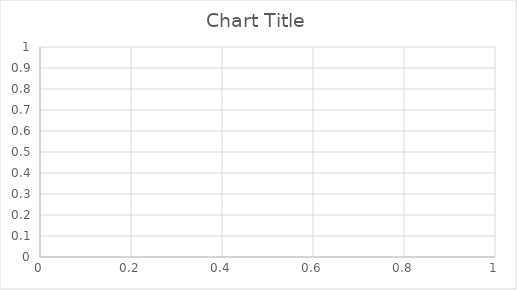
| Category | Series 0 |
|---|---|
| 0 | 0.027 |
| 1 | 0.071 |
| 2 | 0.192 |
| 3 | 0.175 |
| 4 | 0.144 |
| 5 | 0.23 |
| 6 | 0.202 |
| 7 | 0.246 |
| 8 | 0.242 |
| 9 | 0.257 |
| 10 | 0.289 |
| 11 | 0.348 |
| 12 | 0.375 |
| 13 | 0.348 |
| 14 | 0.333 |
| 15 | 0.33 |
| 16 | 0.326 |
| 17 | 0.332 |
| 18 | 0.34 |
| 19 | 0.325 |
| 20 | 0.349 |
| 21 | 0.345 |
| 22 | 0.362 |
| 23 | 0.364 |
| 24 | 0.353 |
| 25 | 0.363 |
| 26 | 0.355 |
| 27 | 0.359 |
| 28 | 0.371 |
| 29 | 0.37 |
| 30 | 0.363 |
| 31 | 0.377 |
| 32 | 0.394 |
| 33 | 0.395 |
| 34 | 0.402 |
| 35 | 0.394 |
| 36 | 0.389 |
| 37 | 0.388 |
| 38 | 0.381 |
| 39 | 0.372 |
| 40 | 0.383 |
| 41 | 0.389 |
| 42 | 0.381 |
| 43 | 0.382 |
| 44 | 0.39 |
| 45 | 0.384 |
| 46 | 0.377 |
| 47 | 0.373 |
| 48 | 0.382 |
| 49 | 0.383 |
| 50 | 0.376 |
| 51 | 0.374 |
| 52 | 0.385 |
| 53 | 0.379 |
| 54 | 0.377 |
| 55 | 0.372 |
| 56 | 0.366 |
| 57 | 0.374 |
| 58 | 0.374 |
| 59 | 0.368 |
| 60 | 0.369 |
| 61 | 0.374 |
| 62 | 0.383 |
| 63 | 0.378 |
| 64 | 0.374 |
| 65 | 0.37 |
| 66 | 0.376 |
| 67 | 0.377 |
| 68 | 0.38 |
| 69 | 0.376 |
| 70 | 0.376 |
| 71 | 0.372 |
| 72 | 0.367 |
| 73 | 0.363 |
| 74 | 0.36 |
| 75 | 0.358 |
| 76 | 0.359 |
| 77 | 0.358 |
| 78 | 0.356 |
| 79 | 0.357 |
| 80 | 0.353 |
| 81 | 0.35 |
| 82 | 0.346 |
| 83 | 0.346 |
| 84 | 0.351 |
| 85 | 0.35 |
| 86 | 0.349 |
| 87 | 0.355 |
| 88 | 0.357 |
| 89 | 0.353 |
| 90 | 0.349 |
| 91 | 0.349 |
| 92 | 0.35 |
| 93 | 0.348 |
| 94 | 0.345 |
| 95 | 0.343 |
| 96 | 0.346 |
| 97 | 0.345 |
| 98 | 0.343 |
| 99 | 0.347 |
| 100 | 0.344 |
| 101 | 0.351 |
| 102 | 0.357 |
| 103 | 0.359 |
| 104 | 0.355 |
| 105 | 0.359 |
| 106 | 0.36 |
| 107 | 0.363 |
| 108 | 0.362 |
| 109 | 0.359 |
| 110 | 0.358 |
| 111 | 0.355 |
| 112 | 0.356 |
| 113 | 0.361 |
| 114 | 0.359 |
| 115 | 0.357 |
| 116 | 0.354 |
| 117 | 0.351 |
| 118 | 0.349 |
| 119 | 0.347 |
| 120 | 0.345 |
| 121 | 0.346 |
| 122 | 0.344 |
| 123 | 0.341 |
| 124 | 0.342 |
| 125 | 0.339 |
| 126 | 0.338 |
| 127 | 0.339 |
| 128 | 0.337 |
| 129 | 0.338 |
| 130 | 0.336 |
| 131 | 0.34 |
| 132 | 0.339 |
| 133 | 0.338 |
| 134 | 0.337 |
| 135 | 0.34 |
| 136 | 0.339 |
| 137 | 0.341 |
| 138 | 0.339 |
| 139 | 0.339 |
| 140 | 0.338 |
| 141 | 0.34 |
| 142 | 0.344 |
| 143 | 0.344 |
| 144 | 0.343 |
| 145 | 0.347 |
| 146 | 0.345 |
| 147 | 0.344 |
| 148 | 0.342 |
| 149 | 0.34 |
| 150 | 0.34 |
| 151 | 0.338 |
| 152 | 0.336 |
| 153 | 0.338 |
| 154 | 0.339 |
| 155 | 0.337 |
| 156 | 0.338 |
| 157 | 0.337 |
| 158 | 0.339 |
| 159 | 0.337 |
| 160 | 0.337 |
| 161 | 0.341 |
| 162 | 0.34 |
| 163 | 0.34 |
| 164 | 0.338 |
| 165 | 0.336 |
| 166 | 0.339 |
| 167 | 0.337 |
| 168 | 0.341 |
| 169 | 0.341 |
| 170 | 0.339 |
| 171 | 0.342 |
| 172 | 0.343 |
| 173 | 0.341 |
| 174 | 0.342 |
| 175 | 0.343 |
| 176 | 0.346 |
| 177 | 0.344 |
| 178 | 0.345 |
| 179 | 0.344 |
| 180 | 0.345 |
| 181 | 0.344 |
| 182 | 0.343 |
| 183 | 0.344 |
| 184 | 0.346 |
| 185 | 0.347 |
| 186 | 0.346 |
| 187 | 0.349 |
| 188 | 0.349 |
| 189 | 0.351 |
| 190 | 0.349 |
| 191 | 0.352 |
| 192 | 0.352 |
| 193 | 0.353 |
| 194 | 0.353 |
| 195 | 0.353 |
| 196 | 0.353 |
| 197 | 0.351 |
| 198 | 0.351 |
| 199 | 0.349 |
| 200 | 0.35 |
| 201 | 0.349 |
| 202 | 0.35 |
| 203 | 0.352 |
| 204 | 0.353 |
| 205 | 0.353 |
| 206 | 0.352 |
| 207 | 0.35 |
| 208 | 0.349 |
| 209 | 0.35 |
| 210 | 0.35 |
| 211 | 0.349 |
| 212 | 0.35 |
| 213 | 0.349 |
| 214 | 0.347 |
| 215 | 0.346 |
| 216 | 0.348 |
| 217 | 0.35 |
| 218 | 0.35 |
| 219 | 0.348 |
| 220 | 0.347 |
| 221 | 0.346 |
| 222 | 0.344 |
| 223 | 0.346 |
| 224 | 0.344 |
| 225 | 0.343 |
| 226 | 0.343 |
| 227 | 0.341 |
| 228 | 0.341 |
| 229 | 0.341 |
| 230 | 0.34 |
| 231 | 0.339 |
| 232 | 0.341 |
| 233 | 0.339 |
| 234 | 0.339 |
| 235 | 0.338 |
| 236 | 0.338 |
| 237 | 0.337 |
| 238 | 0.336 |
| 239 | 0.337 |
| 240 | 0.336 |
| 241 | 0.335 |
| 242 | 0.334 |
| 243 | 0.334 |
| 244 | 0.335 |
| 245 | 0.335 |
| 246 | 0.334 |
| 247 | 0.332 |
| 248 | 0.331 |
| 249 | 0.333 |
| 250 | 0.332 |
| 251 | 0.334 |
| 252 | 0.335 |
| 253 | 0.336 |
| 254 | 0.335 |
| 255 | 0.334 |
| 256 | 0.333 |
| 257 | 0.335 |
| 258 | 0.336 |
| 259 | 0.335 |
| 260 | 0.334 |
| 261 | 0.334 |
| 262 | 0.334 |
| 263 | 0.333 |
| 264 | 0.335 |
| 265 | 0.336 |
| 266 | 0.335 |
| 267 | 0.336 |
| 268 | 0.337 |
| 269 | 0.337 |
| 270 | 0.337 |
| 271 | 0.338 |
| 272 | 0.337 |
| 273 | 0.336 |
| 274 | 0.335 |
| 275 | 0.334 |
| 276 | 0.335 |
| 277 | 0.335 |
| 278 | 0.336 |
| 279 | 0.335 |
| 280 | 0.337 |
| 281 | 0.339 |
| 282 | 0.338 |
| 283 | 0.337 |
| 284 | 0.336 |
| 285 | 0.335 |
| 286 | 0.334 |
| 287 | 0.333 |
| 288 | 0.332 |
| 289 | 0.332 |
| 290 | 0.332 |
| 291 | 0.333 |
| 292 | 0.333 |
| 293 | 0.332 |
| 294 | 0.334 |
| 295 | 0.335 |
| 296 | 0.334 |
| 297 | 0.334 |
| 298 | 0.335 |
| 299 | 0.336 |
| 300 | 0.336 |
| 301 | 0.336 |
| 302 | 0.335 |
| 303 | 0.334 |
| 304 | 0.334 |
| 305 | 0.333 |
| 306 | 0.332 |
| 307 | 0.333 |
| 308 | 0.332 |
| 309 | 0.332 |
| 310 | 0.332 |
| 311 | 0.332 |
| 312 | 0.331 |
| 313 | 0.33 |
| 314 | 0.33 |
| 315 | 0.33 |
| 316 | 0.331 |
| 317 | 0.331 |
| 318 | 0.33 |
| 319 | 0.329 |
| 320 | 0.329 |
| 321 | 0.33 |
| 322 | 0.329 |
| 323 | 0.328 |
| 324 | 0.328 |
| 325 | 0.329 |
| 326 | 0.329 |
| 327 | 0.329 |
| 328 | 0.328 |
| 329 | 0.33 |
| 330 | 0.329 |
| 331 | 0.328 |
| 332 | 0.327 |
| 333 | 0.327 |
| 334 | 0.328 |
| 335 | 0.327 |
| 336 | 0.328 |
| 337 | 0.33 |
| 338 | 0.332 |
| 339 | 0.332 |
| 340 | 0.334 |
| 341 | 0.335 |
| 342 | 0.336 |
| 343 | 0.336 |
| 344 | 0.336 |
| 345 | 0.337 |
| 346 | 0.338 |
| 347 | 0.337 |
| 348 | 0.336 |
| 349 | 0.338 |
| 350 | 0.337 |
| 351 | 0.337 |
| 352 | 0.336 |
| 353 | 0.337 |
| 354 | 0.336 |
| 355 | 0.337 |
| 356 | 0.338 |
| 357 | 0.337 |
| 358 | 0.339 |
| 359 | 0.339 |
| 360 | 0.339 |
| 361 | 0.339 |
| 362 | 0.338 |
| 363 | 0.337 |
| 364 | 0.338 |
| 365 | 0.338 |
| 366 | 0.339 |
| 367 | 0.339 |
| 368 | 0.34 |
| 369 | 0.341 |
| 370 | 0.34 |
| 371 | 0.34 |
| 372 | 0.34 |
| 373 | 0.339 |
| 374 | 0.34 |
| 375 | 0.34 |
| 376 | 0.339 |
| 377 | 0.338 |
| 378 | 0.337 |
| 379 | 0.337 |
| 380 | 0.338 |
| 381 | 0.338 |
| 382 | 0.339 |
| 383 | 0.338 |
| 384 | 0.337 |
| 385 | 0.337 |
| 386 | 0.338 |
| 387 | 0.337 |
| 388 | 0.338 |
| 389 | 0.337 |
| 390 | 0.336 |
| 391 | 0.336 |
| 392 | 0.336 |
| 393 | 0.336 |
| 394 | 0.337 |
| 395 | 0.339 |
| 396 | 0.34 |
| 397 | 0.339 |
| 398 | 0.338 |
| 399 | 0.339 |
| 400 | 0.338 |
| 401 | 0.337 |
| 402 | 0.337 |
| 403 | 0.336 |
| 404 | 0.336 |
| 405 | 0.337 |
| 406 | 0.337 |
| 407 | 0.339 |
| 408 | 0.339 |
| 409 | 0.34 |
| 410 | 0.339 |
| 411 | 0.338 |
| 412 | 0.338 |
| 413 | 0.339 |
| 414 | 0.338 |
| 415 | 0.338 |
| 416 | 0.338 |
| 417 | 0.337 |
| 418 | 0.337 |
| 419 | 0.338 |
| 420 | 0.339 |
| 421 | 0.339 |
| 422 | 0.34 |
| 423 | 0.34 |
| 424 | 0.341 |
| 425 | 0.341 |
| 426 | 0.34 |
| 427 | 0.34 |
| 428 | 0.34 |
| 429 | 0.339 |
| 430 | 0.339 |
| 431 | 0.338 |
| 432 | 0.339 |
| 433 | 0.339 |
| 434 | 0.34 |
| 435 | 0.341 |
| 436 | 0.341 |
| 437 | 0.34 |
| 438 | 0.34 |
| 439 | 0.339 |
| 440 | 0.338 |
| 441 | 0.338 |
| 442 | 0.337 |
| 443 | 0.337 |
| 444 | 0.338 |
| 445 | 0.339 |
| 446 | 0.338 |
| 447 | 0.338 |
| 448 | 0.338 |
| 449 | 0.338 |
| 450 | 0.338 |
| 451 | 0.338 |
| 452 | 0.337 |
| 453 | 0.337 |
| 454 | 0.336 |
| 455 | 0.336 |
| 456 | 0.335 |
| 457 | 0.335 |
| 458 | 0.336 |
| 459 | 0.337 |
| 460 | 0.336 |
| 461 | 0.336 |
| 462 | 0.337 |
| 463 | 0.338 |
| 464 | 0.337 |
| 465 | 0.338 |
| 466 | 0.339 |
| 467 | 0.34 |
| 468 | 0.34 |
| 469 | 0.341 |
| 470 | 0.343 |
| 471 | 0.342 |
| 472 | 0.342 |
| 473 | 0.343 |
| 474 | 0.342 |
| 475 | 0.343 |
| 476 | 0.342 |
| 477 | 0.342 |
| 478 | 0.341 |
| 479 | 0.341 |
| 480 | 0.34 |
| 481 | 0.34 |
| 482 | 0.339 |
| 483 | 0.338 |
| 484 | 0.338 |
| 485 | 0.338 |
| 486 | 0.338 |
| 487 | 0.338 |
| 488 | 0.339 |
| 489 | 0.34 |
| 490 | 0.339 |
| 491 | 0.339 |
| 492 | 0.339 |
| 493 | 0.338 |
| 494 | 0.338 |
| 495 | 0.339 |
| 496 | 0.339 |
| 497 | 0.338 |
| 498 | 0.338 |
| 499 | 0.337 |
| 500 | 0.337 |
| 501 | 0.336 |
| 502 | 0.336 |
| 503 | 0.336 |
| 504 | 0.335 |
| 505 | 0.335 |
| 506 | 0.335 |
| 507 | 0.335 |
| 508 | 0.336 |
| 509 | 0.336 |
| 510 | 0.336 |
| 511 | 0.337 |
| 512 | 0.337 |
| 513 | 0.338 |
| 514 | 0.339 |
| 515 | 0.34 |
| 516 | 0.339 |
| 517 | 0.34 |
| 518 | 0.341 |
| 519 | 0.34 |
| 520 | 0.34 |
| 521 | 0.34 |
| 522 | 0.339 |
| 523 | 0.339 |
| 524 | 0.34 |
| 525 | 0.339 |
| 526 | 0.339 |
| 527 | 0.338 |
| 528 | 0.339 |
| 529 | 0.338 |
| 530 | 0.338 |
| 531 | 0.338 |
| 532 | 0.337 |
| 533 | 0.337 |
| 534 | 0.336 |
| 535 | 0.337 |
| 536 | 0.338 |
| 537 | 0.338 |
| 538 | 0.337 |
| 539 | 0.336 |
| 540 | 0.336 |
| 541 | 0.335 |
| 542 | 0.335 |
| 543 | 0.335 |
| 544 | 0.335 |
| 545 | 0.335 |
| 546 | 0.336 |
| 547 | 0.336 |
| 548 | 0.335 |
| 549 | 0.335 |
| 550 | 0.335 |
| 551 | 0.335 |
| 552 | 0.335 |
| 553 | 0.334 |
| 554 | 0.334 |
| 555 | 0.334 |
| 556 | 0.333 |
| 557 | 0.334 |
| 558 | 0.334 |
| 559 | 0.333 |
| 560 | 0.333 |
| 561 | 0.333 |
| 562 | 0.332 |
| 563 | 0.332 |
| 564 | 0.331 |
| 565 | 0.331 |
| 566 | 0.331 |
| 567 | 0.332 |
| 568 | 0.331 |
| 569 | 0.331 |
| 570 | 0.331 |
| 571 | 0.331 |
| 572 | 0.331 |
| 573 | 0.331 |
| 574 | 0.331 |
| 575 | 0.331 |
| 576 | 0.331 |
| 577 | 0.331 |
| 578 | 0.331 |
| 579 | 0.33 |
| 580 | 0.33 |
| 581 | 0.331 |
| 582 | 0.331 |
| 583 | 0.331 |
| 584 | 0.332 |
| 585 | 0.331 |
| 586 | 0.331 |
| 587 | 0.331 |
| 588 | 0.332 |
| 589 | 0.331 |
| 590 | 0.332 |
| 591 | 0.332 |
| 592 | 0.331 |
| 593 | 0.331 |
| 594 | 0.331 |
| 595 | 0.331 |
| 596 | 0.33 |
| 597 | 0.33 |
| 598 | 0.33 |
| 599 | 0.331 |
| 600 | 0.332 |
| 601 | 0.331 |
| 602 | 0.331 |
| 603 | 0.332 |
| 604 | 0.332 |
| 605 | 0.331 |
| 606 | 0.331 |
| 607 | 0.331 |
| 608 | 0.331 |
| 609 | 0.332 |
| 610 | 0.332 |
| 611 | 0.331 |
| 612 | 0.331 |
| 613 | 0.331 |
| 614 | 0.332 |
| 615 | 0.332 |
| 616 | 0.333 |
| 617 | 0.334 |
| 618 | 0.334 |
| 619 | 0.334 |
| 620 | 0.333 |
| 621 | 0.334 |
| 622 | 0.334 |
| 623 | 0.334 |
| 624 | 0.333 |
| 625 | 0.334 |
| 626 | 0.334 |
| 627 | 0.334 |
| 628 | 0.335 |
| 629 | 0.335 |
| 630 | 0.334 |
| 631 | 0.334 |
| 632 | 0.334 |
| 633 | 0.335 |
| 634 | 0.336 |
| 635 | 0.335 |
| 636 | 0.335 |
| 637 | 0.334 |
| 638 | 0.335 |
| 639 | 0.335 |
| 640 | 0.335 |
| 641 | 0.334 |
| 642 | 0.334 |
| 643 | 0.334 |
| 644 | 0.333 |
| 645 | 0.333 |
| 646 | 0.333 |
| 647 | 0.333 |
| 648 | 0.333 |
| 649 | 0.333 |
| 650 | 0.333 |
| 651 | 0.333 |
| 652 | 0.332 |
| 653 | 0.332 |
| 654 | 0.332 |
| 655 | 0.333 |
| 656 | 0.332 |
| 657 | 0.332 |
| 658 | 0.332 |
| 659 | 0.331 |
| 660 | 0.331 |
| 661 | 0.331 |
| 662 | 0.331 |
| 663 | 0.331 |
| 664 | 0.331 |
| 665 | 0.331 |
| 666 | 0.331 |
| 667 | 0.331 |
| 668 | 0.331 |
| 669 | 0.332 |
| 670 | 0.332 |
| 671 | 0.331 |
| 672 | 0.332 |
| 673 | 0.333 |
| 674 | 0.333 |
| 675 | 0.333 |
| 676 | 0.333 |
| 677 | 0.333 |
| 678 | 0.333 |
| 679 | 0.333 |
| 680 | 0.333 |
| 681 | 0.333 |
| 682 | 0.332 |
| 683 | 0.332 |
| 684 | 0.332 |
| 685 | 0.332 |
| 686 | 0.331 |
| 687 | 0.331 |
| 688 | 0.331 |
| 689 | 0.331 |
| 690 | 0.332 |
| 691 | 0.332 |
| 692 | 0.331 |
| 693 | 0.332 |
| 694 | 0.331 |
| 695 | 0.331 |
| 696 | 0.331 |
| 697 | 0.331 |
| 698 | 0.33 |
| 699 | 0.33 |
| 700 | 0.33 |
| 701 | 0.331 |
| 702 | 0.331 |
| 703 | 0.331 |
| 704 | 0.331 |
| 705 | 0.331 |
| 706 | 0.331 |
| 707 | 0.331 |
| 708 | 0.331 |
| 709 | 0.33 |
| 710 | 0.331 |
| 711 | 0.331 |
| 712 | 0.332 |
| 713 | 0.331 |
| 714 | 0.331 |
| 715 | 0.331 |
| 716 | 0.332 |
| 717 | 0.332 |
| 718 | 0.332 |
| 719 | 0.332 |
| 720 | 0.331 |
| 721 | 0.332 |
| 722 | 0.333 |
| 723 | 0.334 |
| 724 | 0.334 |
| 725 | 0.333 |
| 726 | 0.334 |
| 727 | 0.334 |
| 728 | 0.334 |
| 729 | 0.334 |
| 730 | 0.335 |
| 731 | 0.335 |
| 732 | 0.335 |
| 733 | 0.335 |
| 734 | 0.335 |
| 735 | 0.335 |
| 736 | 0.336 |
| 737 | 0.335 |
| 738 | 0.336 |
| 739 | 0.336 |
| 740 | 0.337 |
| 741 | 0.336 |
| 742 | 0.336 |
| 743 | 0.336 |
| 744 | 0.336 |
| 745 | 0.336 |
| 746 | 0.336 |
| 747 | 0.336 |
| 748 | 0.336 |
| 749 | 0.337 |
| 750 | 0.337 |
| 751 | 0.337 |
| 752 | 0.337 |
| 753 | 0.338 |
| 754 | 0.338 |
| 755 | 0.338 |
| 756 | 0.339 |
| 757 | 0.339 |
| 758 | 0.338 |
| 759 | 0.339 |
| 760 | 0.338 |
| 761 | 0.338 |
| 762 | 0.338 |
| 763 | 0.338 |
| 764 | 0.337 |
| 765 | 0.337 |
| 766 | 0.338 |
| 767 | 0.338 |
| 768 | 0.338 |
| 769 | 0.339 |
| 770 | 0.339 |
| 771 | 0.339 |
| 772 | 0.339 |
| 773 | 0.339 |
| 774 | 0.339 |
| 775 | 0.339 |
| 776 | 0.339 |
| 777 | 0.339 |
| 778 | 0.338 |
| 779 | 0.338 |
| 780 | 0.338 |
| 781 | 0.338 |
| 782 | 0.338 |
| 783 | 0.338 |
| 784 | 0.338 |
| 785 | 0.338 |
| 786 | 0.338 |
| 787 | 0.338 |
| 788 | 0.338 |
| 789 | 0.337 |
| 790 | 0.338 |
| 791 | 0.338 |
| 792 | 0.337 |
| 793 | 0.337 |
| 794 | 0.337 |
| 795 | 0.337 |
| 796 | 0.336 |
| 797 | 0.336 |
| 798 | 0.336 |
| 799 | 0.335 |
| 800 | 0.335 |
| 801 | 0.335 |
| 802 | 0.336 |
| 803 | 0.336 |
| 804 | 0.336 |
| 805 | 0.336 |
| 806 | 0.336 |
| 807 | 0.337 |
| 808 | 0.336 |
| 809 | 0.336 |
| 810 | 0.336 |
| 811 | 0.336 |
| 812 | 0.335 |
| 813 | 0.335 |
| 814 | 0.335 |
| 815 | 0.335 |
| 816 | 0.334 |
| 817 | 0.334 |
| 818 | 0.334 |
| 819 | 0.333 |
| 820 | 0.334 |
| 821 | 0.334 |
| 822 | 0.334 |
| 823 | 0.334 |
| 824 | 0.334 |
| 825 | 0.333 |
| 826 | 0.334 |
| 827 | 0.334 |
| 828 | 0.335 |
| 829 | 0.334 |
| 830 | 0.335 |
| 831 | 0.336 |
| 832 | 0.336 |
| 833 | 0.335 |
| 834 | 0.335 |
| 835 | 0.335 |
| 836 | 0.335 |
| 837 | 0.335 |
| 838 | 0.335 |
| 839 | 0.335 |
| 840 | 0.334 |
| 841 | 0.334 |
| 842 | 0.335 |
| 843 | 0.335 |
| 844 | 0.335 |
| 845 | 0.334 |
| 846 | 0.334 |
| 847 | 0.334 |
| 848 | 0.334 |
| 849 | 0.335 |
| 850 | 0.335 |
| 851 | 0.335 |
| 852 | 0.335 |
| 853 | 0.335 |
| 854 | 0.335 |
| 855 | 0.336 |
| 856 | 0.336 |
| 857 | 0.335 |
| 858 | 0.335 |
| 859 | 0.335 |
| 860 | 0.334 |
| 861 | 0.334 |
| 862 | 0.334 |
| 863 | 0.334 |
| 864 | 0.333 |
| 865 | 0.333 |
| 866 | 0.333 |
| 867 | 0.333 |
| 868 | 0.333 |
| 869 | 0.332 |
| 870 | 0.332 |
| 871 | 0.332 |
| 872 | 0.332 |
| 873 | 0.332 |
| 874 | 0.332 |
| 875 | 0.332 |
| 876 | 0.332 |
| 877 | 0.331 |
| 878 | 0.331 |
| 879 | 0.331 |
| 880 | 0.332 |
| 881 | 0.331 |
| 882 | 0.331 |
| 883 | 0.331 |
| 884 | 0.33 |
| 885 | 0.33 |
| 886 | 0.33 |
| 887 | 0.33 |
| 888 | 0.33 |
| 889 | 0.331 |
| 890 | 0.331 |
| 891 | 0.331 |
| 892 | 0.33 |
| 893 | 0.33 |
| 894 | 0.33 |
| 895 | 0.33 |
| 896 | 0.33 |
| 897 | 0.33 |
| 898 | 0.33 |
| 899 | 0.331 |
| 900 | 0.331 |
| 901 | 0.33 |
| 902 | 0.331 |
| 903 | 0.331 |
| 904 | 0.331 |
| 905 | 0.331 |
| 906 | 0.331 |
| 907 | 0.331 |
| 908 | 0.331 |
| 909 | 0.331 |
| 910 | 0.331 |
| 911 | 0.332 |
| 912 | 0.332 |
| 913 | 0.332 |
| 914 | 0.332 |
| 915 | 0.332 |
| 916 | 0.332 |
| 917 | 0.332 |
| 918 | 0.331 |
| 919 | 0.331 |
| 920 | 0.331 |
| 921 | 0.331 |
| 922 | 0.33 |
| 923 | 0.331 |
| 924 | 0.331 |
| 925 | 0.331 |
| 926 | 0.332 |
| 927 | 0.331 |
| 928 | 0.331 |
| 929 | 0.331 |
| 930 | 0.33 |
| 931 | 0.33 |
| 932 | 0.33 |
| 933 | 0.329 |
| 934 | 0.329 |
| 935 | 0.329 |
| 936 | 0.328 |
| 937 | 0.328 |
| 938 | 0.329 |
| 939 | 0.328 |
| 940 | 0.328 |
| 941 | 0.328 |
| 942 | 0.328 |
| 943 | 0.327 |
| 944 | 0.327 |
| 945 | 0.327 |
| 946 | 0.327 |
| 947 | 0.327 |
| 948 | 0.328 |
| 949 | 0.327 |
| 950 | 0.327 |
| 951 | 0.327 |
| 952 | 0.327 |
| 953 | 0.327 |
| 954 | 0.327 |
| 955 | 0.328 |
| 956 | 0.327 |
| 957 | 0.327 |
| 958 | 0.327 |
| 959 | 0.327 |
| 960 | 0.327 |
| 961 | 0.327 |
| 962 | 0.327 |
| 963 | 0.327 |
| 964 | 0.327 |
| 965 | 0.327 |
| 966 | 0.327 |
| 967 | 0.327 |
| 968 | 0.327 |
| 969 | 0.326 |
| 970 | 0.327 |
| 971 | 0.326 |
| 972 | 0.326 |
| 973 | 0.326 |
| 974 | 0.326 |
| 975 | 0.326 |
| 976 | 0.326 |
| 977 | 0.326 |
| 978 | 0.326 |
| 979 | 0.326 |
| 980 | 0.326 |
| 981 | 0.326 |
| 982 | 0.326 |
| 983 | 0.326 |
| 984 | 0.326 |
| 985 | 0.326 |
| 986 | 0.326 |
| 987 | 0.326 |
| 988 | 0.327 |
| 989 | 0.327 |
| 990 | 0.327 |
| 991 | 0.327 |
| 992 | 0.327 |
| 993 | 0.326 |
| 994 | 0.326 |
| 995 | 0.327 |
| 996 | 0.327 |
| 997 | 0.326 |
| 998 | 0.326 |
| 999 | 0.326 |
| 1000 | 0.326 |
| 1001 | 0.326 |
| 1002 | 0.326 |
| 1003 | 0.326 |
| 1004 | 0.326 |
| 1005 | 0.327 |
| 1006 | 0.327 |
| 1007 | 0.326 |
| 1008 | 0.326 |
| 1009 | 0.326 |
| 1010 | 0.326 |
| 1011 | 0.326 |
| 1012 | 0.326 |
| 1013 | 0.326 |
| 1014 | 0.326 |
| 1015 | 0.325 |
| 1016 | 0.326 |
| 1017 | 0.326 |
| 1018 | 0.326 |
| 1019 | 0.326 |
| 1020 | 0.326 |
| 1021 | 0.326 |
| 1022 | 0.327 |
| 1023 | 0.327 |
| 1024 | 0.327 |
| 1025 | 0.327 |
| 1026 | 0.327 |
| 1027 | 0.327 |
| 1028 | 0.327 |
| 1029 | 0.327 |
| 1030 | 0.327 |
| 1031 | 0.327 |
| 1032 | 0.327 |
| 1033 | 0.326 |
| 1034 | 0.327 |
| 1035 | 0.327 |
| 1036 | 0.327 |
| 1037 | 0.327 |
| 1038 | 0.327 |
| 1039 | 0.326 |
| 1040 | 0.326 |
| 1041 | 0.326 |
| 1042 | 0.326 |
| 1043 | 0.326 |
| 1044 | 0.326 |
| 1045 | 0.326 |
| 1046 | 0.325 |
| 1047 | 0.325 |
| 1048 | 0.326 |
| 1049 | 0.325 |
| 1050 | 0.325 |
| 1051 | 0.325 |
| 1052 | 0.325 |
| 1053 | 0.325 |
| 1054 | 0.325 |
| 1055 | 0.325 |
| 1056 | 0.325 |
| 1057 | 0.325 |
| 1058 | 0.326 |
| 1059 | 0.326 |
| 1060 | 0.327 |
| 1061 | 0.326 |
| 1062 | 0.326 |
| 1063 | 0.327 |
| 1064 | 0.327 |
| 1065 | 0.327 |
| 1066 | 0.327 |
| 1067 | 0.327 |
| 1068 | 0.328 |
| 1069 | 0.328 |
| 1070 | 0.327 |
| 1071 | 0.328 |
| 1072 | 0.328 |
| 1073 | 0.328 |
| 1074 | 0.328 |
| 1075 | 0.329 |
| 1076 | 0.329 |
| 1077 | 0.329 |
| 1078 | 0.328 |
| 1079 | 0.328 |
| 1080 | 0.328 |
| 1081 | 0.328 |
| 1082 | 0.328 |
| 1083 | 0.328 |
| 1084 | 0.328 |
| 1085 | 0.329 |
| 1086 | 0.329 |
| 1087 | 0.328 |
| 1088 | 0.328 |
| 1089 | 0.328 |
| 1090 | 0.328 |
| 1091 | 0.328 |
| 1092 | 0.328 |
| 1093 | 0.328 |
| 1094 | 0.328 |
| 1095 | 0.328 |
| 1096 | 0.328 |
| 1097 | 0.328 |
| 1098 | 0.328 |
| 1099 | 0.328 |
| 1100 | 0.328 |
| 1101 | 0.328 |
| 1102 | 0.328 |
| 1103 | 0.328 |
| 1104 | 0.328 |
| 1105 | 0.328 |
| 1106 | 0.328 |
| 1107 | 0.328 |
| 1108 | 0.329 |
| 1109 | 0.328 |
| 1110 | 0.328 |
| 1111 | 0.328 |
| 1112 | 0.328 |
| 1113 | 0.328 |
| 1114 | 0.328 |
| 1115 | 0.328 |
| 1116 | 0.327 |
| 1117 | 0.328 |
| 1118 | 0.327 |
| 1119 | 0.327 |
| 1120 | 0.327 |
| 1121 | 0.327 |
| 1122 | 0.327 |
| 1123 | 0.327 |
| 1124 | 0.327 |
| 1125 | 0.327 |
| 1126 | 0.327 |
| 1127 | 0.327 |
| 1128 | 0.327 |
| 1129 | 0.326 |
| 1130 | 0.327 |
| 1131 | 0.326 |
| 1132 | 0.327 |
| 1133 | 0.326 |
| 1134 | 0.326 |
| 1135 | 0.327 |
| 1136 | 0.326 |
| 1137 | 0.326 |
| 1138 | 0.327 |
| 1139 | 0.326 |
| 1140 | 0.326 |
| 1141 | 0.326 |
| 1142 | 0.326 |
| 1143 | 0.326 |
| 1144 | 0.325 |
| 1145 | 0.325 |
| 1146 | 0.326 |
| 1147 | 0.326 |
| 1148 | 0.326 |
| 1149 | 0.326 |
| 1150 | 0.327 |
| 1151 | 0.327 |
| 1152 | 0.327 |
| 1153 | 0.327 |
| 1154 | 0.326 |
| 1155 | 0.326 |
| 1156 | 0.327 |
| 1157 | 0.327 |
| 1158 | 0.328 |
| 1159 | 0.328 |
| 1160 | 0.328 |
| 1161 | 0.328 |
| 1162 | 0.328 |
| 1163 | 0.328 |
| 1164 | 0.328 |
| 1165 | 0.328 |
| 1166 | 0.328 |
| 1167 | 0.328 |
| 1168 | 0.328 |
| 1169 | 0.328 |
| 1170 | 0.328 |
| 1171 | 0.327 |
| 1172 | 0.327 |
| 1173 | 0.327 |
| 1174 | 0.327 |
| 1175 | 0.327 |
| 1176 | 0.328 |
| 1177 | 0.328 |
| 1178 | 0.327 |
| 1179 | 0.328 |
| 1180 | 0.327 |
| 1181 | 0.327 |
| 1182 | 0.328 |
| 1183 | 0.328 |
| 1184 | 0.328 |
| 1185 | 0.328 |
| 1186 | 0.328 |
| 1187 | 0.328 |
| 1188 | 0.328 |
| 1189 | 0.328 |
| 1190 | 0.328 |
| 1191 | 0.328 |
| 1192 | 0.328 |
| 1193 | 0.328 |
| 1194 | 0.328 |
| 1195 | 0.329 |
| 1196 | 0.329 |
| 1197 | 0.329 |
| 1198 | 0.329 |
| 1199 | 0.33 |
| 1200 | 0.329 |
| 1201 | 0.329 |
| 1202 | 0.329 |
| 1203 | 0.329 |
| 1204 | 0.329 |
| 1205 | 0.329 |
| 1206 | 0.329 |
| 1207 | 0.329 |
| 1208 | 0.329 |
| 1209 | 0.329 |
| 1210 | 0.329 |
| 1211 | 0.329 |
| 1212 | 0.329 |
| 1213 | 0.329 |
| 1214 | 0.329 |
| 1215 | 0.328 |
| 1216 | 0.328 |
| 1217 | 0.328 |
| 1218 | 0.328 |
| 1219 | 0.329 |
| 1220 | 0.328 |
| 1221 | 0.328 |
| 1222 | 0.328 |
| 1223 | 0.328 |
| 1224 | 0.328 |
| 1225 | 0.328 |
| 1226 | 0.327 |
| 1227 | 0.328 |
| 1228 | 0.328 |
| 1229 | 0.327 |
| 1230 | 0.327 |
| 1231 | 0.327 |
| 1232 | 0.327 |
| 1233 | 0.327 |
| 1234 | 0.328 |
| 1235 | 0.327 |
| 1236 | 0.327 |
| 1237 | 0.328 |
| 1238 | 0.327 |
| 1239 | 0.328 |
| 1240 | 0.327 |
| 1241 | 0.327 |
| 1242 | 0.328 |
| 1243 | 0.328 |
| 1244 | 0.328 |
| 1245 | 0.328 |
| 1246 | 0.329 |
| 1247 | 0.328 |
| 1248 | 0.329 |
| 1249 | 0.329 |
| 1250 | 0.329 |
| 1251 | 0.329 |
| 1252 | 0.329 |
| 1253 | 0.329 |
| 1254 | 0.328 |
| 1255 | 0.329 |
| 1256 | 0.329 |
| 1257 | 0.329 |
| 1258 | 0.329 |
| 1259 | 0.329 |
| 1260 | 0.329 |
| 1261 | 0.328 |
| 1262 | 0.329 |
| 1263 | 0.329 |
| 1264 | 0.329 |
| 1265 | 0.328 |
| 1266 | 0.328 |
| 1267 | 0.329 |
| 1268 | 0.329 |
| 1269 | 0.329 |
| 1270 | 0.329 |
| 1271 | 0.33 |
| 1272 | 0.33 |
| 1273 | 0.33 |
| 1274 | 0.33 |
| 1275 | 0.33 |
| 1276 | 0.33 |
| 1277 | 0.33 |
| 1278 | 0.33 |
| 1279 | 0.33 |
| 1280 | 0.329 |
| 1281 | 0.329 |
| 1282 | 0.329 |
| 1283 | 0.329 |
| 1284 | 0.329 |
| 1285 | 0.329 |
| 1286 | 0.329 |
| 1287 | 0.329 |
| 1288 | 0.329 |
| 1289 | 0.329 |
| 1290 | 0.329 |
| 1291 | 0.329 |
| 1292 | 0.329 |
| 1293 | 0.329 |
| 1294 | 0.33 |
| 1295 | 0.33 |
| 1296 | 0.33 |
| 1297 | 0.33 |
| 1298 | 0.33 |
| 1299 | 0.33 |
| 1300 | 0.33 |
| 1301 | 0.33 |
| 1302 | 0.33 |
| 1303 | 0.33 |
| 1304 | 0.33 |
| 1305 | 0.33 |
| 1306 | 0.329 |
| 1307 | 0.33 |
| 1308 | 0.33 |
| 1309 | 0.33 |
| 1310 | 0.33 |
| 1311 | 0.33 |
| 1312 | 0.33 |
| 1313 | 0.33 |
| 1314 | 0.33 |
| 1315 | 0.33 |
| 1316 | 0.33 |
| 1317 | 0.329 |
| 1318 | 0.329 |
| 1319 | 0.329 |
| 1320 | 0.329 |
| 1321 | 0.329 |
| 1322 | 0.329 |
| 1323 | 0.329 |
| 1324 | 0.329 |
| 1325 | 0.329 |
| 1326 | 0.328 |
| 1327 | 0.328 |
| 1328 | 0.328 |
| 1329 | 0.328 |
| 1330 | 0.328 |
| 1331 | 0.328 |
| 1332 | 0.328 |
| 1333 | 0.329 |
| 1334 | 0.328 |
| 1335 | 0.329 |
| 1336 | 0.329 |
| 1337 | 0.329 |
| 1338 | 0.329 |
| 1339 | 0.328 |
| 1340 | 0.328 |
| 1341 | 0.328 |
| 1342 | 0.328 |
| 1343 | 0.328 |
| 1344 | 0.328 |
| 1345 | 0.328 |
| 1346 | 0.329 |
| 1347 | 0.329 |
| 1348 | 0.329 |
| 1349 | 0.329 |
| 1350 | 0.329 |
| 1351 | 0.329 |
| 1352 | 0.329 |
| 1353 | 0.329 |
| 1354 | 0.329 |
| 1355 | 0.329 |
| 1356 | 0.328 |
| 1357 | 0.328 |
| 1358 | 0.328 |
| 1359 | 0.328 |
| 1360 | 0.328 |
| 1361 | 0.329 |
| 1362 | 0.329 |
| 1363 | 0.328 |
| 1364 | 0.328 |
| 1365 | 0.328 |
| 1366 | 0.328 |
| 1367 | 0.328 |
| 1368 | 0.329 |
| 1369 | 0.329 |
| 1370 | 0.329 |
| 1371 | 0.328 |
| 1372 | 0.328 |
| 1373 | 0.328 |
| 1374 | 0.328 |
| 1375 | 0.329 |
| 1376 | 0.328 |
| 1377 | 0.328 |
| 1378 | 0.328 |
| 1379 | 0.328 |
| 1380 | 0.329 |
| 1381 | 0.328 |
| 1382 | 0.328 |
| 1383 | 0.328 |
| 1384 | 0.328 |
| 1385 | 0.328 |
| 1386 | 0.329 |
| 1387 | 0.329 |
| 1388 | 0.328 |
| 1389 | 0.329 |
| 1390 | 0.329 |
| 1391 | 0.329 |
| 1392 | 0.328 |
| 1393 | 0.329 |
| 1394 | 0.329 |
| 1395 | 0.329 |
| 1396 | 0.329 |
| 1397 | 0.33 |
| 1398 | 0.33 |
| 1399 | 0.33 |
| 1400 | 0.33 |
| 1401 | 0.33 |
| 1402 | 0.33 |
| 1403 | 0.33 |
| 1404 | 0.33 |
| 1405 | 0.33 |
| 1406 | 0.33 |
| 1407 | 0.33 |
| 1408 | 0.329 |
| 1409 | 0.329 |
| 1410 | 0.329 |
| 1411 | 0.329 |
| 1412 | 0.329 |
| 1413 | 0.329 |
| 1414 | 0.329 |
| 1415 | 0.329 |
| 1416 | 0.329 |
| 1417 | 0.329 |
| 1418 | 0.328 |
| 1419 | 0.328 |
| 1420 | 0.328 |
| 1421 | 0.328 |
| 1422 | 0.329 |
| 1423 | 0.329 |
| 1424 | 0.329 |
| 1425 | 0.329 |
| 1426 | 0.329 |
| 1427 | 0.329 |
| 1428 | 0.329 |
| 1429 | 0.329 |
| 1430 | 0.329 |
| 1431 | 0.33 |
| 1432 | 0.33 |
| 1433 | 0.33 |
| 1434 | 0.33 |
| 1435 | 0.33 |
| 1436 | 0.33 |
| 1437 | 0.33 |
| 1438 | 0.33 |
| 1439 | 0.33 |
| 1440 | 0.33 |
| 1441 | 0.33 |
| 1442 | 0.33 |
| 1443 | 0.331 |
| 1444 | 0.331 |
| 1445 | 0.33 |
| 1446 | 0.33 |
| 1447 | 0.33 |
| 1448 | 0.33 |
| 1449 | 0.331 |
| 1450 | 0.331 |
| 1451 | 0.33 |
| 1452 | 0.33 |
| 1453 | 0.331 |
| 1454 | 0.33 |
| 1455 | 0.33 |
| 1456 | 0.33 |
| 1457 | 0.331 |
| 1458 | 0.331 |
| 1459 | 0.33 |
| 1460 | 0.33 |
| 1461 | 0.33 |
| 1462 | 0.33 |
| 1463 | 0.33 |
| 1464 | 0.33 |
| 1465 | 0.33 |
| 1466 | 0.33 |
| 1467 | 0.33 |
| 1468 | 0.33 |
| 1469 | 0.33 |
| 1470 | 0.329 |
| 1471 | 0.329 |
| 1472 | 0.329 |
| 1473 | 0.329 |
| 1474 | 0.329 |
| 1475 | 0.329 |
| 1476 | 0.329 |
| 1477 | 0.329 |
| 1478 | 0.329 |
| 1479 | 0.329 |
| 1480 | 0.329 |
| 1481 | 0.329 |
| 1482 | 0.329 |
| 1483 | 0.329 |
| 1484 | 0.329 |
| 1485 | 0.329 |
| 1486 | 0.329 |
| 1487 | 0.329 |
| 1488 | 0.329 |
| 1489 | 0.329 |
| 1490 | 0.329 |
| 1491 | 0.329 |
| 1492 | 0.329 |
| 1493 | 0.329 |
| 1494 | 0.328 |
| 1495 | 0.328 |
| 1496 | 0.328 |
| 1497 | 0.328 |
| 1498 | 0.328 |
| 1499 | 0.328 |
| 1500 | 0.328 |
| 1501 | 0.329 |
| 1502 | 0.328 |
| 1503 | 0.328 |
| 1504 | 0.328 |
| 1505 | 0.329 |
| 1506 | 0.328 |
| 1507 | 0.328 |
| 1508 | 0.328 |
| 1509 | 0.329 |
| 1510 | 0.329 |
| 1511 | 0.328 |
| 1512 | 0.329 |
| 1513 | 0.329 |
| 1514 | 0.329 |
| 1515 | 0.329 |
| 1516 | 0.329 |
| 1517 | 0.329 |
| 1518 | 0.328 |
| 1519 | 0.328 |
| 1520 | 0.328 |
| 1521 | 0.328 |
| 1522 | 0.328 |
| 1523 | 0.328 |
| 1524 | 0.328 |
| 1525 | 0.328 |
| 1526 | 0.328 |
| 1527 | 0.328 |
| 1528 | 0.329 |
| 1529 | 0.328 |
| 1530 | 0.328 |
| 1531 | 0.328 |
| 1532 | 0.328 |
| 1533 | 0.328 |
| 1534 | 0.328 |
| 1535 | 0.328 |
| 1536 | 0.328 |
| 1537 | 0.328 |
| 1538 | 0.328 |
| 1539 | 0.328 |
| 1540 | 0.328 |
| 1541 | 0.327 |
| 1542 | 0.327 |
| 1543 | 0.328 |
| 1544 | 0.327 |
| 1545 | 0.328 |
| 1546 | 0.327 |
| 1547 | 0.328 |
| 1548 | 0.327 |
| 1549 | 0.327 |
| 1550 | 0.327 |
| 1551 | 0.327 |
| 1552 | 0.327 |
| 1553 | 0.327 |
| 1554 | 0.327 |
| 1555 | 0.327 |
| 1556 | 0.327 |
| 1557 | 0.327 |
| 1558 | 0.327 |
| 1559 | 0.327 |
| 1560 | 0.327 |
| 1561 | 0.327 |
| 1562 | 0.327 |
| 1563 | 0.327 |
| 1564 | 0.327 |
| 1565 | 0.327 |
| 1566 | 0.327 |
| 1567 | 0.327 |
| 1568 | 0.327 |
| 1569 | 0.327 |
| 1570 | 0.327 |
| 1571 | 0.327 |
| 1572 | 0.327 |
| 1573 | 0.327 |
| 1574 | 0.327 |
| 1575 | 0.327 |
| 1576 | 0.327 |
| 1577 | 0.327 |
| 1578 | 0.327 |
| 1579 | 0.327 |
| 1580 | 0.327 |
| 1581 | 0.326 |
| 1582 | 0.327 |
| 1583 | 0.327 |
| 1584 | 0.327 |
| 1585 | 0.327 |
| 1586 | 0.327 |
| 1587 | 0.327 |
| 1588 | 0.327 |
| 1589 | 0.327 |
| 1590 | 0.327 |
| 1591 | 0.327 |
| 1592 | 0.327 |
| 1593 | 0.327 |
| 1594 | 0.327 |
| 1595 | 0.327 |
| 1596 | 0.327 |
| 1597 | 0.327 |
| 1598 | 0.327 |
| 1599 | 0.327 |
| 1600 | 0.327 |
| 1601 | 0.326 |
| 1602 | 0.326 |
| 1603 | 0.327 |
| 1604 | 0.326 |
| 1605 | 0.326 |
| 1606 | 0.326 |
| 1607 | 0.326 |
| 1608 | 0.326 |
| 1609 | 0.326 |
| 1610 | 0.326 |
| 1611 | 0.327 |
| 1612 | 0.326 |
| 1613 | 0.326 |
| 1614 | 0.326 |
| 1615 | 0.326 |
| 1616 | 0.326 |
| 1617 | 0.326 |
| 1618 | 0.326 |
| 1619 | 0.327 |
| 1620 | 0.327 |
| 1621 | 0.327 |
| 1622 | 0.326 |
| 1623 | 0.326 |
| 1624 | 0.326 |
| 1625 | 0.327 |
| 1626 | 0.327 |
| 1627 | 0.327 |
| 1628 | 0.327 |
| 1629 | 0.327 |
| 1630 | 0.327 |
| 1631 | 0.327 |
| 1632 | 0.327 |
| 1633 | 0.327 |
| 1634 | 0.327 |
| 1635 | 0.327 |
| 1636 | 0.327 |
| 1637 | 0.327 |
| 1638 | 0.326 |
| 1639 | 0.327 |
| 1640 | 0.327 |
| 1641 | 0.327 |
| 1642 | 0.327 |
| 1643 | 0.327 |
| 1644 | 0.326 |
| 1645 | 0.326 |
| 1646 | 0.326 |
| 1647 | 0.326 |
| 1648 | 0.326 |
| 1649 | 0.327 |
| 1650 | 0.327 |
| 1651 | 0.326 |
| 1652 | 0.326 |
| 1653 | 0.326 |
| 1654 | 0.326 |
| 1655 | 0.326 |
| 1656 | 0.326 |
| 1657 | 0.326 |
| 1658 | 0.326 |
| 1659 | 0.326 |
| 1660 | 0.326 |
| 1661 | 0.326 |
| 1662 | 0.326 |
| 1663 | 0.326 |
| 1664 | 0.326 |
| 1665 | 0.326 |
| 1666 | 0.325 |
| 1667 | 0.325 |
| 1668 | 0.325 |
| 1669 | 0.325 |
| 1670 | 0.325 |
| 1671 | 0.325 |
| 1672 | 0.325 |
| 1673 | 0.325 |
| 1674 | 0.325 |
| 1675 | 0.325 |
| 1676 | 0.325 |
| 1677 | 0.325 |
| 1678 | 0.324 |
| 1679 | 0.324 |
| 1680 | 0.325 |
| 1681 | 0.325 |
| 1682 | 0.325 |
| 1683 | 0.325 |
| 1684 | 0.324 |
| 1685 | 0.324 |
| 1686 | 0.324 |
| 1687 | 0.324 |
| 1688 | 0.324 |
| 1689 | 0.324 |
| 1690 | 0.324 |
| 1691 | 0.324 |
| 1692 | 0.324 |
| 1693 | 0.324 |
| 1694 | 0.324 |
| 1695 | 0.324 |
| 1696 | 0.324 |
| 1697 | 0.324 |
| 1698 | 0.324 |
| 1699 | 0.324 |
| 1700 | 0.325 |
| 1701 | 0.325 |
| 1702 | 0.325 |
| 1703 | 0.325 |
| 1704 | 0.325 |
| 1705 | 0.325 |
| 1706 | 0.325 |
| 1707 | 0.325 |
| 1708 | 0.325 |
| 1709 | 0.325 |
| 1710 | 0.325 |
| 1711 | 0.325 |
| 1712 | 0.325 |
| 1713 | 0.325 |
| 1714 | 0.325 |
| 1715 | 0.325 |
| 1716 | 0.324 |
| 1717 | 0.325 |
| 1718 | 0.325 |
| 1719 | 0.325 |
| 1720 | 0.325 |
| 1721 | 0.325 |
| 1722 | 0.325 |
| 1723 | 0.324 |
| 1724 | 0.325 |
| 1725 | 0.325 |
| 1726 | 0.325 |
| 1727 | 0.325 |
| 1728 | 0.325 |
| 1729 | 0.325 |
| 1730 | 0.325 |
| 1731 | 0.325 |
| 1732 | 0.325 |
| 1733 | 0.325 |
| 1734 | 0.325 |
| 1735 | 0.325 |
| 1736 | 0.325 |
| 1737 | 0.325 |
| 1738 | 0.325 |
| 1739 | 0.325 |
| 1740 | 0.325 |
| 1741 | 0.325 |
| 1742 | 0.325 |
| 1743 | 0.325 |
| 1744 | 0.325 |
| 1745 | 0.325 |
| 1746 | 0.325 |
| 1747 | 0.325 |
| 1748 | 0.325 |
| 1749 | 0.325 |
| 1750 | 0.325 |
| 1751 | 0.325 |
| 1752 | 0.325 |
| 1753 | 0.325 |
| 1754 | 0.325 |
| 1755 | 0.325 |
| 1756 | 0.325 |
| 1757 | 0.325 |
| 1758 | 0.325 |
| 1759 | 0.325 |
| 1760 | 0.324 |
| 1761 | 0.324 |
| 1762 | 0.325 |
| 1763 | 0.324 |
| 1764 | 0.324 |
| 1765 | 0.324 |
| 1766 | 0.324 |
| 1767 | 0.324 |
| 1768 | 0.324 |
| 1769 | 0.324 |
| 1770 | 0.324 |
| 1771 | 0.324 |
| 1772 | 0.324 |
| 1773 | 0.324 |
| 1774 | 0.324 |
| 1775 | 0.324 |
| 1776 | 0.324 |
| 1777 | 0.324 |
| 1778 | 0.324 |
| 1779 | 0.324 |
| 1780 | 0.324 |
| 1781 | 0.324 |
| 1782 | 0.324 |
| 1783 | 0.324 |
| 1784 | 0.325 |
| 1785 | 0.325 |
| 1786 | 0.325 |
| 1787 | 0.325 |
| 1788 | 0.325 |
| 1789 | 0.324 |
| 1790 | 0.324 |
| 1791 | 0.324 |
| 1792 | 0.324 |
| 1793 | 0.324 |
| 1794 | 0.324 |
| 1795 | 0.324 |
| 1796 | 0.324 |
| 1797 | 0.324 |
| 1798 | 0.324 |
| 1799 | 0.324 |
| 1800 | 0.324 |
| 1801 | 0.325 |
| 1802 | 0.325 |
| 1803 | 0.325 |
| 1804 | 0.325 |
| 1805 | 0.325 |
| 1806 | 0.325 |
| 1807 | 0.325 |
| 1808 | 0.325 |
| 1809 | 0.325 |
| 1810 | 0.325 |
| 1811 | 0.325 |
| 1812 | 0.325 |
| 1813 | 0.324 |
| 1814 | 0.324 |
| 1815 | 0.324 |
| 1816 | 0.324 |
| 1817 | 0.324 |
| 1818 | 0.325 |
| 1819 | 0.324 |
| 1820 | 0.324 |
| 1821 | 0.324 |
| 1822 | 0.324 |
| 1823 | 0.324 |
| 1824 | 0.325 |
| 1825 | 0.325 |
| 1826 | 0.325 |
| 1827 | 0.325 |
| 1828 | 0.325 |
| 1829 | 0.325 |
| 1830 | 0.325 |
| 1831 | 0.325 |
| 1832 | 0.325 |
| 1833 | 0.325 |
| 1834 | 0.325 |
| 1835 | 0.326 |
| 1836 | 0.326 |
| 1837 | 0.326 |
| 1838 | 0.325 |
| 1839 | 0.325 |
| 1840 | 0.326 |
| 1841 | 0.326 |
| 1842 | 0.326 |
| 1843 | 0.326 |
| 1844 | 0.326 |
| 1845 | 0.326 |
| 1846 | 0.327 |
| 1847 | 0.326 |
| 1848 | 0.327 |
| 1849 | 0.327 |
| 1850 | 0.327 |
| 1851 | 0.327 |
| 1852 | 0.327 |
| 1853 | 0.327 |
| 1854 | 0.326 |
| 1855 | 0.327 |
| 1856 | 0.327 |
| 1857 | 0.327 |
| 1858 | 0.327 |
| 1859 | 0.327 |
| 1860 | 0.327 |
| 1861 | 0.327 |
| 1862 | 0.327 |
| 1863 | 0.327 |
| 1864 | 0.327 |
| 1865 | 0.327 |
| 1866 | 0.327 |
| 1867 | 0.327 |
| 1868 | 0.328 |
| 1869 | 0.328 |
| 1870 | 0.328 |
| 1871 | 0.328 |
| 1872 | 0.328 |
| 1873 | 0.328 |
| 1874 | 0.328 |
| 1875 | 0.328 |
| 1876 | 0.328 |
| 1877 | 0.328 |
| 1878 | 0.328 |
| 1879 | 0.328 |
| 1880 | 0.328 |
| 1881 | 0.328 |
| 1882 | 0.328 |
| 1883 | 0.328 |
| 1884 | 0.328 |
| 1885 | 0.328 |
| 1886 | 0.328 |
| 1887 | 0.327 |
| 1888 | 0.327 |
| 1889 | 0.327 |
| 1890 | 0.327 |
| 1891 | 0.327 |
| 1892 | 0.327 |
| 1893 | 0.327 |
| 1894 | 0.327 |
| 1895 | 0.326 |
| 1896 | 0.326 |
| 1897 | 0.327 |
| 1898 | 0.327 |
| 1899 | 0.327 |
| 1900 | 0.327 |
| 1901 | 0.327 |
| 1902 | 0.327 |
| 1903 | 0.326 |
| 1904 | 0.326 |
| 1905 | 0.326 |
| 1906 | 0.327 |
| 1907 | 0.327 |
| 1908 | 0.327 |
| 1909 | 0.327 |
| 1910 | 0.327 |
| 1911 | 0.326 |
| 1912 | 0.326 |
| 1913 | 0.326 |
| 1914 | 0.326 |
| 1915 | 0.326 |
| 1916 | 0.326 |
| 1917 | 0.326 |
| 1918 | 0.326 |
| 1919 | 0.326 |
| 1920 | 0.327 |
| 1921 | 0.327 |
| 1922 | 0.327 |
| 1923 | 0.327 |
| 1924 | 0.327 |
| 1925 | 0.328 |
| 1926 | 0.328 |
| 1927 | 0.327 |
| 1928 | 0.328 |
| 1929 | 0.328 |
| 1930 | 0.328 |
| 1931 | 0.328 |
| 1932 | 0.328 |
| 1933 | 0.328 |
| 1934 | 0.328 |
| 1935 | 0.327 |
| 1936 | 0.327 |
| 1937 | 0.328 |
| 1938 | 0.328 |
| 1939 | 0.328 |
| 1940 | 0.328 |
| 1941 | 0.328 |
| 1942 | 0.328 |
| 1943 | 0.328 |
| 1944 | 0.328 |
| 1945 | 0.328 |
| 1946 | 0.327 |
| 1947 | 0.328 |
| 1948 | 0.328 |
| 1949 | 0.328 |
| 1950 | 0.328 |
| 1951 | 0.328 |
| 1952 | 0.328 |
| 1953 | 0.328 |
| 1954 | 0.328 |
| 1955 | 0.328 |
| 1956 | 0.328 |
| 1957 | 0.328 |
| 1958 | 0.328 |
| 1959 | 0.329 |
| 1960 | 0.329 |
| 1961 | 0.329 |
| 1962 | 0.329 |
| 1963 | 0.328 |
| 1964 | 0.328 |
| 1965 | 0.328 |
| 1966 | 0.328 |
| 1967 | 0.328 |
| 1968 | 0.328 |
| 1969 | 0.328 |
| 1970 | 0.328 |
| 1971 | 0.328 |
| 1972 | 0.328 |
| 1973 | 0.328 |
| 1974 | 0.328 |
| 1975 | 0.328 |
| 1976 | 0.328 |
| 1977 | 0.328 |
| 1978 | 0.328 |
| 1979 | 0.328 |
| 1980 | 0.328 |
| 1981 | 0.328 |
| 1982 | 0.328 |
| 1983 | 0.328 |
| 1984 | 0.328 |
| 1985 | 0.328 |
| 1986 | 0.328 |
| 1987 | 0.328 |
| 1988 | 0.328 |
| 1989 | 0.328 |
| 1990 | 0.328 |
| 1991 | 0.328 |
| 1992 | 0.328 |
| 1993 | 0.328 |
| 1994 | 0.328 |
| 1995 | 0.328 |
| 1996 | 0.328 |
| 1997 | 0.328 |
| 1998 | 0.328 |
| 1999 | 0.328 |
| 2000 | 0.328 |
| 2001 | 0.328 |
| 2002 | 0.328 |
| 2003 | 0.328 |
| 2004 | 0.328 |
| 2005 | 0.328 |
| 2006 | 0.328 |
| 2007 | 0.328 |
| 2008 | 0.329 |
| 2009 | 0.329 |
| 2010 | 0.329 |
| 2011 | 0.328 |
| 2012 | 0.329 |
| 2013 | 0.329 |
| 2014 | 0.329 |
| 2015 | 0.329 |
| 2016 | 0.329 |
| 2017 | 0.329 |
| 2018 | 0.329 |
| 2019 | 0.329 |
| 2020 | 0.328 |
| 2021 | 0.329 |
| 2022 | 0.328 |
| 2023 | 0.328 |
| 2024 | 0.328 |
| 2025 | 0.329 |
| 2026 | 0.329 |
| 2027 | 0.329 |
| 2028 | 0.329 |
| 2029 | 0.329 |
| 2030 | 0.329 |
| 2031 | 0.329 |
| 2032 | 0.329 |
| 2033 | 0.329 |
| 2034 | 0.329 |
| 2035 | 0.329 |
| 2036 | 0.329 |
| 2037 | 0.329 |
| 2038 | 0.329 |
| 2039 | 0.329 |
| 2040 | 0.329 |
| 2041 | 0.329 |
| 2042 | 0.329 |
| 2043 | 0.329 |
| 2044 | 0.329 |
| 2045 | 0.329 |
| 2046 | 0.329 |
| 2047 | 0.329 |
| 2048 | 0.329 |
| 2049 | 0.329 |
| 2050 | 0.329 |
| 2051 | 0.329 |
| 2052 | 0.329 |
| 2053 | 0.329 |
| 2054 | 0.33 |
| 2055 | 0.33 |
| 2056 | 0.33 |
| 2057 | 0.33 |
| 2058 | 0.33 |
| 2059 | 0.33 |
| 2060 | 0.33 |
| 2061 | 0.33 |
| 2062 | 0.33 |
| 2063 | 0.33 |
| 2064 | 0.33 |
| 2065 | 0.33 |
| 2066 | 0.33 |
| 2067 | 0.33 |
| 2068 | 0.33 |
| 2069 | 0.33 |
| 2070 | 0.33 |
| 2071 | 0.33 |
| 2072 | 0.33 |
| 2073 | 0.33 |
| 2074 | 0.33 |
| 2075 | 0.33 |
| 2076 | 0.33 |
| 2077 | 0.331 |
| 2078 | 0.33 |
| 2079 | 0.33 |
| 2080 | 0.33 |
| 2081 | 0.33 |
| 2082 | 0.33 |
| 2083 | 0.33 |
| 2084 | 0.33 |
| 2085 | 0.33 |
| 2086 | 0.33 |
| 2087 | 0.33 |
| 2088 | 0.33 |
| 2089 | 0.33 |
| 2090 | 0.33 |
| 2091 | 0.33 |
| 2092 | 0.33 |
| 2093 | 0.33 |
| 2094 | 0.33 |
| 2095 | 0.33 |
| 2096 | 0.33 |
| 2097 | 0.33 |
| 2098 | 0.33 |
| 2099 | 0.33 |
| 2100 | 0.33 |
| 2101 | 0.33 |
| 2102 | 0.33 |
| 2103 | 0.33 |
| 2104 | 0.331 |
| 2105 | 0.331 |
| 2106 | 0.33 |
| 2107 | 0.331 |
| 2108 | 0.331 |
| 2109 | 0.331 |
| 2110 | 0.331 |
| 2111 | 0.331 |
| 2112 | 0.331 |
| 2113 | 0.331 |
| 2114 | 0.331 |
| 2115 | 0.331 |
| 2116 | 0.331 |
| 2117 | 0.331 |
| 2118 | 0.331 |
| 2119 | 0.33 |
| 2120 | 0.331 |
| 2121 | 0.331 |
| 2122 | 0.331 |
| 2123 | 0.331 |
| 2124 | 0.331 |
| 2125 | 0.331 |
| 2126 | 0.331 |
| 2127 | 0.331 |
| 2128 | 0.331 |
| 2129 | 0.331 |
| 2130 | 0.332 |
| 2131 | 0.332 |
| 2132 | 0.331 |
| 2133 | 0.331 |
| 2134 | 0.331 |
| 2135 | 0.331 |
| 2136 | 0.331 |
| 2137 | 0.331 |
| 2138 | 0.331 |
| 2139 | 0.331 |
| 2140 | 0.331 |
| 2141 | 0.331 |
| 2142 | 0.331 |
| 2143 | 0.33 |
| 2144 | 0.33 |
| 2145 | 0.33 |
| 2146 | 0.33 |
| 2147 | 0.33 |
| 2148 | 0.33 |
| 2149 | 0.33 |
| 2150 | 0.33 |
| 2151 | 0.33 |
| 2152 | 0.33 |
| 2153 | 0.33 |
| 2154 | 0.331 |
| 2155 | 0.33 |
| 2156 | 0.33 |
| 2157 | 0.33 |
| 2158 | 0.331 |
| 2159 | 0.331 |
| 2160 | 0.331 |
| 2161 | 0.331 |
| 2162 | 0.331 |
| 2163 | 0.331 |
| 2164 | 0.331 |
| 2165 | 0.331 |
| 2166 | 0.332 |
| 2167 | 0.332 |
| 2168 | 0.332 |
| 2169 | 0.332 |
| 2170 | 0.332 |
| 2171 | 0.332 |
| 2172 | 0.332 |
| 2173 | 0.332 |
| 2174 | 0.332 |
| 2175 | 0.332 |
| 2176 | 0.332 |
| 2177 | 0.332 |
| 2178 | 0.332 |
| 2179 | 0.332 |
| 2180 | 0.332 |
| 2181 | 0.332 |
| 2182 | 0.332 |
| 2183 | 0.332 |
| 2184 | 0.332 |
| 2185 | 0.332 |
| 2186 | 0.332 |
| 2187 | 0.332 |
| 2188 | 0.332 |
| 2189 | 0.332 |
| 2190 | 0.332 |
| 2191 | 0.332 |
| 2192 | 0.332 |
| 2193 | 0.332 |
| 2194 | 0.332 |
| 2195 | 0.332 |
| 2196 | 0.332 |
| 2197 | 0.333 |
| 2198 | 0.333 |
| 2199 | 0.333 |
| 2200 | 0.333 |
| 2201 | 0.333 |
| 2202 | 0.333 |
| 2203 | 0.332 |
| 2204 | 0.333 |
| 2205 | 0.333 |
| 2206 | 0.333 |
| 2207 | 0.333 |
| 2208 | 0.333 |
| 2209 | 0.333 |
| 2210 | 0.333 |
| 2211 | 0.333 |
| 2212 | 0.333 |
| 2213 | 0.333 |
| 2214 | 0.333 |
| 2215 | 0.333 |
| 2216 | 0.333 |
| 2217 | 0.333 |
| 2218 | 0.332 |
| 2219 | 0.333 |
| 2220 | 0.333 |
| 2221 | 0.333 |
| 2222 | 0.333 |
| 2223 | 0.333 |
| 2224 | 0.332 |
| 2225 | 0.333 |
| 2226 | 0.333 |
| 2227 | 0.333 |
| 2228 | 0.333 |
| 2229 | 0.333 |
| 2230 | 0.333 |
| 2231 | 0.333 |
| 2232 | 0.333 |
| 2233 | 0.333 |
| 2234 | 0.333 |
| 2235 | 0.333 |
| 2236 | 0.332 |
| 2237 | 0.332 |
| 2238 | 0.332 |
| 2239 | 0.332 |
| 2240 | 0.332 |
| 2241 | 0.333 |
| 2242 | 0.333 |
| 2243 | 0.333 |
| 2244 | 0.333 |
| 2245 | 0.333 |
| 2246 | 0.333 |
| 2247 | 0.333 |
| 2248 | 0.333 |
| 2249 | 0.333 |
| 2250 | 0.332 |
| 2251 | 0.332 |
| 2252 | 0.332 |
| 2253 | 0.332 |
| 2254 | 0.332 |
| 2255 | 0.332 |
| 2256 | 0.332 |
| 2257 | 0.332 |
| 2258 | 0.332 |
| 2259 | 0.332 |
| 2260 | 0.332 |
| 2261 | 0.333 |
| 2262 | 0.333 |
| 2263 | 0.332 |
| 2264 | 0.332 |
| 2265 | 0.332 |
| 2266 | 0.332 |
| 2267 | 0.332 |
| 2268 | 0.332 |
| 2269 | 0.333 |
| 2270 | 0.332 |
| 2271 | 0.333 |
| 2272 | 0.332 |
| 2273 | 0.333 |
| 2274 | 0.332 |
| 2275 | 0.332 |
| 2276 | 0.333 |
| 2277 | 0.333 |
| 2278 | 0.333 |
| 2279 | 0.333 |
| 2280 | 0.332 |
| 2281 | 0.332 |
| 2282 | 0.332 |
| 2283 | 0.332 |
| 2284 | 0.332 |
| 2285 | 0.332 |
| 2286 | 0.332 |
| 2287 | 0.333 |
| 2288 | 0.332 |
| 2289 | 0.332 |
| 2290 | 0.332 |
| 2291 | 0.332 |
| 2292 | 0.332 |
| 2293 | 0.332 |
| 2294 | 0.332 |
| 2295 | 0.332 |
| 2296 | 0.333 |
| 2297 | 0.332 |
| 2298 | 0.332 |
| 2299 | 0.332 |
| 2300 | 0.333 |
| 2301 | 0.333 |
| 2302 | 0.333 |
| 2303 | 0.333 |
| 2304 | 0.333 |
| 2305 | 0.333 |
| 2306 | 0.333 |
| 2307 | 0.333 |
| 2308 | 0.333 |
| 2309 | 0.333 |
| 2310 | 0.333 |
| 2311 | 0.333 |
| 2312 | 0.333 |
| 2313 | 0.333 |
| 2314 | 0.333 |
| 2315 | 0.333 |
| 2316 | 0.333 |
| 2317 | 0.333 |
| 2318 | 0.333 |
| 2319 | 0.333 |
| 2320 | 0.333 |
| 2321 | 0.333 |
| 2322 | 0.333 |
| 2323 | 0.333 |
| 2324 | 0.332 |
| 2325 | 0.333 |
| 2326 | 0.333 |
| 2327 | 0.333 |
| 2328 | 0.333 |
| 2329 | 0.333 |
| 2330 | 0.333 |
| 2331 | 0.333 |
| 2332 | 0.333 |
| 2333 | 0.333 |
| 2334 | 0.333 |
| 2335 | 0.333 |
| 2336 | 0.333 |
| 2337 | 0.333 |
| 2338 | 0.332 |
| 2339 | 0.333 |
| 2340 | 0.333 |
| 2341 | 0.333 |
| 2342 | 0.333 |
| 2343 | 0.333 |
| 2344 | 0.333 |
| 2345 | 0.333 |
| 2346 | 0.333 |
| 2347 | 0.333 |
| 2348 | 0.333 |
| 2349 | 0.333 |
| 2350 | 0.333 |
| 2351 | 0.333 |
| 2352 | 0.333 |
| 2353 | 0.333 |
| 2354 | 0.333 |
| 2355 | 0.333 |
| 2356 | 0.333 |
| 2357 | 0.333 |
| 2358 | 0.333 |
| 2359 | 0.333 |
| 2360 | 0.333 |
| 2361 | 0.333 |
| 2362 | 0.333 |
| 2363 | 0.333 |
| 2364 | 0.333 |
| 2365 | 0.333 |
| 2366 | 0.333 |
| 2367 | 0.333 |
| 2368 | 0.333 |
| 2369 | 0.333 |
| 2370 | 0.333 |
| 2371 | 0.333 |
| 2372 | 0.333 |
| 2373 | 0.333 |
| 2374 | 0.333 |
| 2375 | 0.333 |
| 2376 | 0.333 |
| 2377 | 0.333 |
| 2378 | 0.333 |
| 2379 | 0.333 |
| 2380 | 0.333 |
| 2381 | 0.333 |
| 2382 | 0.333 |
| 2383 | 0.333 |
| 2384 | 0.333 |
| 2385 | 0.333 |
| 2386 | 0.334 |
| 2387 | 0.334 |
| 2388 | 0.334 |
| 2389 | 0.334 |
| 2390 | 0.333 |
| 2391 | 0.333 |
| 2392 | 0.333 |
| 2393 | 0.333 |
| 2394 | 0.333 |
| 2395 | 0.333 |
| 2396 | 0.333 |
| 2397 | 0.333 |
| 2398 | 0.334 |
| 2399 | 0.334 |
| 2400 | 0.334 |
| 2401 | 0.334 |
| 2402 | 0.334 |
| 2403 | 0.334 |
| 2404 | 0.334 |
| 2405 | 0.334 |
| 2406 | 0.334 |
| 2407 | 0.334 |
| 2408 | 0.334 |
| 2409 | 0.334 |
| 2410 | 0.334 |
| 2411 | 0.334 |
| 2412 | 0.334 |
| 2413 | 0.334 |
| 2414 | 0.334 |
| 2415 | 0.333 |
| 2416 | 0.334 |
| 2417 | 0.334 |
| 2418 | 0.334 |
| 2419 | 0.334 |
| 2420 | 0.334 |
| 2421 | 0.334 |
| 2422 | 0.333 |
| 2423 | 0.333 |
| 2424 | 0.333 |
| 2425 | 0.333 |
| 2426 | 0.333 |
| 2427 | 0.333 |
| 2428 | 0.333 |
| 2429 | 0.333 |
| 2430 | 0.333 |
| 2431 | 0.333 |
| 2432 | 0.333 |
| 2433 | 0.333 |
| 2434 | 0.333 |
| 2435 | 0.333 |
| 2436 | 0.333 |
| 2437 | 0.333 |
| 2438 | 0.333 |
| 2439 | 0.333 |
| 2440 | 0.333 |
| 2441 | 0.333 |
| 2442 | 0.333 |
| 2443 | 0.333 |
| 2444 | 0.333 |
| 2445 | 0.333 |
| 2446 | 0.333 |
| 2447 | 0.333 |
| 2448 | 0.333 |
| 2449 | 0.333 |
| 2450 | 0.333 |
| 2451 | 0.333 |
| 2452 | 0.333 |
| 2453 | 0.333 |
| 2454 | 0.333 |
| 2455 | 0.333 |
| 2456 | 0.333 |
| 2457 | 0.333 |
| 2458 | 0.333 |
| 2459 | 0.333 |
| 2460 | 0.333 |
| 2461 | 0.333 |
| 2462 | 0.333 |
| 2463 | 0.333 |
| 2464 | 0.333 |
| 2465 | 0.333 |
| 2466 | 0.333 |
| 2467 | 0.333 |
| 2468 | 0.333 |
| 2469 | 0.333 |
| 2470 | 0.333 |
| 2471 | 0.333 |
| 2472 | 0.333 |
| 2473 | 0.333 |
| 2474 | 0.333 |
| 2475 | 0.333 |
| 2476 | 0.333 |
| 2477 | 0.334 |
| 2478 | 0.334 |
| 2479 | 0.333 |
| 2480 | 0.334 |
| 2481 | 0.334 |
| 2482 | 0.334 |
| 2483 | 0.334 |
| 2484 | 0.333 |
| 2485 | 0.333 |
| 2486 | 0.333 |
| 2487 | 0.333 |
| 2488 | 0.334 |
| 2489 | 0.333 |
| 2490 | 0.333 |
| 2491 | 0.333 |
| 2492 | 0.333 |
| 2493 | 0.333 |
| 2494 | 0.333 |
| 2495 | 0.333 |
| 2496 | 0.333 |
| 2497 | 0.333 |
| 2498 | 0.333 |
| 2499 | 0.333 |
| 2500 | 0.333 |
| 2501 | 0.333 |
| 2502 | 0.333 |
| 2503 | 0.333 |
| 2504 | 0.333 |
| 2505 | 0.333 |
| 2506 | 0.333 |
| 2507 | 0.333 |
| 2508 | 0.333 |
| 2509 | 0.333 |
| 2510 | 0.333 |
| 2511 | 0.333 |
| 2512 | 0.333 |
| 2513 | 0.333 |
| 2514 | 0.333 |
| 2515 | 0.333 |
| 2516 | 0.333 |
| 2517 | 0.333 |
| 2518 | 0.333 |
| 2519 | 0.333 |
| 2520 | 0.333 |
| 2521 | 0.333 |
| 2522 | 0.333 |
| 2523 | 0.333 |
| 2524 | 0.333 |
| 2525 | 0.333 |
| 2526 | 0.333 |
| 2527 | 0.333 |
| 2528 | 0.333 |
| 2529 | 0.333 |
| 2530 | 0.333 |
| 2531 | 0.333 |
| 2532 | 0.333 |
| 2533 | 0.333 |
| 2534 | 0.333 |
| 2535 | 0.333 |
| 2536 | 0.333 |
| 2537 | 0.333 |
| 2538 | 0.333 |
| 2539 | 0.333 |
| 2540 | 0.333 |
| 2541 | 0.333 |
| 2542 | 0.333 |
| 2543 | 0.333 |
| 2544 | 0.333 |
| 2545 | 0.333 |
| 2546 | 0.333 |
| 2547 | 0.333 |
| 2548 | 0.333 |
| 2549 | 0.333 |
| 2550 | 0.333 |
| 2551 | 0.333 |
| 2552 | 0.333 |
| 2553 | 0.333 |
| 2554 | 0.333 |
| 2555 | 0.333 |
| 2556 | 0.333 |
| 2557 | 0.333 |
| 2558 | 0.333 |
| 2559 | 0.333 |
| 2560 | 0.333 |
| 2561 | 0.333 |
| 2562 | 0.333 |
| 2563 | 0.333 |
| 2564 | 0.333 |
| 2565 | 0.333 |
| 2566 | 0.333 |
| 2567 | 0.333 |
| 2568 | 0.333 |
| 2569 | 0.333 |
| 2570 | 0.333 |
| 2571 | 0.334 |
| 2572 | 0.334 |
| 2573 | 0.334 |
| 2574 | 0.334 |
| 2575 | 0.334 |
| 2576 | 0.334 |
| 2577 | 0.334 |
| 2578 | 0.334 |
| 2579 | 0.334 |
| 2580 | 0.334 |
| 2581 | 0.334 |
| 2582 | 0.334 |
| 2583 | 0.334 |
| 2584 | 0.334 |
| 2585 | 0.334 |
| 2586 | 0.334 |
| 2587 | 0.334 |
| 2588 | 0.334 |
| 2589 | 0.334 |
| 2590 | 0.334 |
| 2591 | 0.334 |
| 2592 | 0.334 |
| 2593 | 0.334 |
| 2594 | 0.334 |
| 2595 | 0.334 |
| 2596 | 0.334 |
| 2597 | 0.334 |
| 2598 | 0.334 |
| 2599 | 0.334 |
| 2600 | 0.334 |
| 2601 | 0.334 |
| 2602 | 0.334 |
| 2603 | 0.334 |
| 2604 | 0.334 |
| 2605 | 0.334 |
| 2606 | 0.334 |
| 2607 | 0.334 |
| 2608 | 0.335 |
| 2609 | 0.335 |
| 2610 | 0.335 |
| 2611 | 0.335 |
| 2612 | 0.335 |
| 2613 | 0.334 |
| 2614 | 0.334 |
| 2615 | 0.335 |
| 2616 | 0.334 |
| 2617 | 0.335 |
| 2618 | 0.335 |
| 2619 | 0.335 |
| 2620 | 0.335 |
| 2621 | 0.335 |
| 2622 | 0.335 |
| 2623 | 0.335 |
| 2624 | 0.335 |
| 2625 | 0.335 |
| 2626 | 0.335 |
| 2627 | 0.335 |
| 2628 | 0.335 |
| 2629 | 0.334 |
| 2630 | 0.335 |
| 2631 | 0.335 |
| 2632 | 0.335 |
| 2633 | 0.335 |
| 2634 | 0.335 |
| 2635 | 0.335 |
| 2636 | 0.335 |
| 2637 | 0.335 |
| 2638 | 0.335 |
| 2639 | 0.335 |
| 2640 | 0.335 |
| 2641 | 0.335 |
| 2642 | 0.335 |
| 2643 | 0.335 |
| 2644 | 0.335 |
| 2645 | 0.335 |
| 2646 | 0.335 |
| 2647 | 0.335 |
| 2648 | 0.336 |
| 2649 | 0.336 |
| 2650 | 0.336 |
| 2651 | 0.336 |
| 2652 | 0.336 |
| 2653 | 0.336 |
| 2654 | 0.335 |
| 2655 | 0.336 |
| 2656 | 0.336 |
| 2657 | 0.336 |
| 2658 | 0.336 |
| 2659 | 0.336 |
| 2660 | 0.336 |
| 2661 | 0.336 |
| 2662 | 0.336 |
| 2663 | 0.336 |
| 2664 | 0.336 |
| 2665 | 0.336 |
| 2666 | 0.336 |
| 2667 | 0.336 |
| 2668 | 0.336 |
| 2669 | 0.336 |
| 2670 | 0.336 |
| 2671 | 0.336 |
| 2672 | 0.336 |
| 2673 | 0.336 |
| 2674 | 0.336 |
| 2675 | 0.336 |
| 2676 | 0.336 |
| 2677 | 0.336 |
| 2678 | 0.336 |
| 2679 | 0.336 |
| 2680 | 0.336 |
| 2681 | 0.336 |
| 2682 | 0.336 |
| 2683 | 0.336 |
| 2684 | 0.336 |
| 2685 | 0.336 |
| 2686 | 0.336 |
| 2687 | 0.336 |
| 2688 | 0.337 |
| 2689 | 0.337 |
| 2690 | 0.337 |
| 2691 | 0.336 |
| 2692 | 0.336 |
| 2693 | 0.336 |
| 2694 | 0.336 |
| 2695 | 0.336 |
| 2696 | 0.336 |
| 2697 | 0.336 |
| 2698 | 0.336 |
| 2699 | 0.336 |
| 2700 | 0.336 |
| 2701 | 0.336 |
| 2702 | 0.336 |
| 2703 | 0.336 |
| 2704 | 0.336 |
| 2705 | 0.336 |
| 2706 | 0.336 |
| 2707 | 0.336 |
| 2708 | 0.336 |
| 2709 | 0.336 |
| 2710 | 0.336 |
| 2711 | 0.336 |
| 2712 | 0.336 |
| 2713 | 0.336 |
| 2714 | 0.336 |
| 2715 | 0.336 |
| 2716 | 0.336 |
| 2717 | 0.336 |
| 2718 | 0.336 |
| 2719 | 0.336 |
| 2720 | 0.336 |
| 2721 | 0.336 |
| 2722 | 0.336 |
| 2723 | 0.336 |
| 2724 | 0.336 |
| 2725 | 0.336 |
| 2726 | 0.336 |
| 2727 | 0.336 |
| 2728 | 0.336 |
| 2729 | 0.336 |
| 2730 | 0.336 |
| 2731 | 0.335 |
| 2732 | 0.336 |
| 2733 | 0.335 |
| 2734 | 0.335 |
| 2735 | 0.335 |
| 2736 | 0.335 |
| 2737 | 0.335 |
| 2738 | 0.335 |
| 2739 | 0.335 |
| 2740 | 0.335 |
| 2741 | 0.335 |
| 2742 | 0.335 |
| 2743 | 0.335 |
| 2744 | 0.335 |
| 2745 | 0.335 |
| 2746 | 0.335 |
| 2747 | 0.335 |
| 2748 | 0.335 |
| 2749 | 0.335 |
| 2750 | 0.335 |
| 2751 | 0.335 |
| 2752 | 0.335 |
| 2753 | 0.335 |
| 2754 | 0.335 |
| 2755 | 0.335 |
| 2756 | 0.335 |
| 2757 | 0.335 |
| 2758 | 0.335 |
| 2759 | 0.335 |
| 2760 | 0.335 |
| 2761 | 0.335 |
| 2762 | 0.335 |
| 2763 | 0.335 |
| 2764 | 0.335 |
| 2765 | 0.335 |
| 2766 | 0.335 |
| 2767 | 0.335 |
| 2768 | 0.335 |
| 2769 | 0.335 |
| 2770 | 0.336 |
| 2771 | 0.336 |
| 2772 | 0.336 |
| 2773 | 0.336 |
| 2774 | 0.336 |
| 2775 | 0.336 |
| 2776 | 0.335 |
| 2777 | 0.335 |
| 2778 | 0.335 |
| 2779 | 0.335 |
| 2780 | 0.335 |
| 2781 | 0.335 |
| 2782 | 0.336 |
| 2783 | 0.336 |
| 2784 | 0.335 |
| 2785 | 0.335 |
| 2786 | 0.335 |
| 2787 | 0.335 |
| 2788 | 0.335 |
| 2789 | 0.335 |
| 2790 | 0.335 |
| 2791 | 0.336 |
| 2792 | 0.335 |
| 2793 | 0.335 |
| 2794 | 0.335 |
| 2795 | 0.335 |
| 2796 | 0.335 |
| 2797 | 0.335 |
| 2798 | 0.336 |
| 2799 | 0.336 |
| 2800 | 0.336 |
| 2801 | 0.335 |
| 2802 | 0.335 |
| 2803 | 0.336 |
| 2804 | 0.335 |
| 2805 | 0.335 |
| 2806 | 0.335 |
| 2807 | 0.335 |
| 2808 | 0.335 |
| 2809 | 0.335 |
| 2810 | 0.335 |
| 2811 | 0.335 |
| 2812 | 0.335 |
| 2813 | 0.335 |
| 2814 | 0.335 |
| 2815 | 0.335 |
| 2816 | 0.335 |
| 2817 | 0.335 |
| 2818 | 0.335 |
| 2819 | 0.335 |
| 2820 | 0.335 |
| 2821 | 0.335 |
| 2822 | 0.335 |
| 2823 | 0.335 |
| 2824 | 0.335 |
| 2825 | 0.335 |
| 2826 | 0.335 |
| 2827 | 0.335 |
| 2828 | 0.335 |
| 2829 | 0.335 |
| 2830 | 0.335 |
| 2831 | 0.335 |
| 2832 | 0.335 |
| 2833 | 0.335 |
| 2834 | 0.335 |
| 2835 | 0.336 |
| 2836 | 0.336 |
| 2837 | 0.335 |
| 2838 | 0.335 |
| 2839 | 0.335 |
| 2840 | 0.335 |
| 2841 | 0.335 |
| 2842 | 0.335 |
| 2843 | 0.335 |
| 2844 | 0.335 |
| 2845 | 0.335 |
| 2846 | 0.335 |
| 2847 | 0.335 |
| 2848 | 0.335 |
| 2849 | 0.335 |
| 2850 | 0.336 |
| 2851 | 0.335 |
| 2852 | 0.335 |
| 2853 | 0.335 |
| 2854 | 0.335 |
| 2855 | 0.335 |
| 2856 | 0.335 |
| 2857 | 0.336 |
| 2858 | 0.336 |
| 2859 | 0.336 |
| 2860 | 0.336 |
| 2861 | 0.335 |
| 2862 | 0.335 |
| 2863 | 0.335 |
| 2864 | 0.335 |
| 2865 | 0.335 |
| 2866 | 0.335 |
| 2867 | 0.335 |
| 2868 | 0.335 |
| 2869 | 0.335 |
| 2870 | 0.335 |
| 2871 | 0.335 |
| 2872 | 0.335 |
| 2873 | 0.335 |
| 2874 | 0.335 |
| 2875 | 0.335 |
| 2876 | 0.335 |
| 2877 | 0.335 |
| 2878 | 0.335 |
| 2879 | 0.335 |
| 2880 | 0.335 |
| 2881 | 0.335 |
| 2882 | 0.335 |
| 2883 | 0.335 |
| 2884 | 0.335 |
| 2885 | 0.335 |
| 2886 | 0.335 |
| 2887 | 0.335 |
| 2888 | 0.335 |
| 2889 | 0.335 |
| 2890 | 0.335 |
| 2891 | 0.335 |
| 2892 | 0.335 |
| 2893 | 0.335 |
| 2894 | 0.335 |
| 2895 | 0.335 |
| 2896 | 0.335 |
| 2897 | 0.335 |
| 2898 | 0.335 |
| 2899 | 0.335 |
| 2900 | 0.335 |
| 2901 | 0.335 |
| 2902 | 0.335 |
| 2903 | 0.335 |
| 2904 | 0.335 |
| 2905 | 0.334 |
| 2906 | 0.334 |
| 2907 | 0.334 |
| 2908 | 0.334 |
| 2909 | 0.334 |
| 2910 | 0.334 |
| 2911 | 0.334 |
| 2912 | 0.334 |
| 2913 | 0.334 |
| 2914 | 0.334 |
| 2915 | 0.334 |
| 2916 | 0.334 |
| 2917 | 0.334 |
| 2918 | 0.334 |
| 2919 | 0.334 |
| 2920 | 0.334 |
| 2921 | 0.334 |
| 2922 | 0.334 |
| 2923 | 0.334 |
| 2924 | 0.334 |
| 2925 | 0.334 |
| 2926 | 0.334 |
| 2927 | 0.334 |
| 2928 | 0.334 |
| 2929 | 0.334 |
| 2930 | 0.334 |
| 2931 | 0.334 |
| 2932 | 0.334 |
| 2933 | 0.334 |
| 2934 | 0.334 |
| 2935 | 0.334 |
| 2936 | 0.334 |
| 2937 | 0.334 |
| 2938 | 0.334 |
| 2939 | 0.334 |
| 2940 | 0.334 |
| 2941 | 0.335 |
| 2942 | 0.335 |
| 2943 | 0.335 |
| 2944 | 0.335 |
| 2945 | 0.335 |
| 2946 | 0.335 |
| 2947 | 0.335 |
| 2948 | 0.335 |
| 2949 | 0.335 |
| 2950 | 0.335 |
| 2951 | 0.335 |
| 2952 | 0.335 |
| 2953 | 0.334 |
| 2954 | 0.334 |
| 2955 | 0.334 |
| 2956 | 0.334 |
| 2957 | 0.334 |
| 2958 | 0.334 |
| 2959 | 0.334 |
| 2960 | 0.334 |
| 2961 | 0.335 |
| 2962 | 0.334 |
| 2963 | 0.334 |
| 2964 | 0.334 |
| 2965 | 0.335 |
| 2966 | 0.334 |
| 2967 | 0.334 |
| 2968 | 0.335 |
| 2969 | 0.335 |
| 2970 | 0.335 |
| 2971 | 0.335 |
| 2972 | 0.335 |
| 2973 | 0.335 |
| 2974 | 0.335 |
| 2975 | 0.335 |
| 2976 | 0.335 |
| 2977 | 0.335 |
| 2978 | 0.335 |
| 2979 | 0.335 |
| 2980 | 0.335 |
| 2981 | 0.335 |
| 2982 | 0.335 |
| 2983 | 0.335 |
| 2984 | 0.335 |
| 2985 | 0.335 |
| 2986 | 0.335 |
| 2987 | 0.335 |
| 2988 | 0.335 |
| 2989 | 0.335 |
| 2990 | 0.335 |
| 2991 | 0.335 |
| 2992 | 0.335 |
| 2993 | 0.335 |
| 2994 | 0.335 |
| 2995 | 0.335 |
| 2996 | 0.335 |
| 2997 | 0.336 |
| 2998 | 0.336 |
| 2999 | 0.336 |
| 3000 | 0.336 |
| 3001 | 0.336 |
| 3002 | 0.336 |
| 3003 | 0.336 |
| 3004 | 0.335 |
| 3005 | 0.335 |
| 3006 | 0.335 |
| 3007 | 0.335 |
| 3008 | 0.335 |
| 3009 | 0.335 |
| 3010 | 0.335 |
| 3011 | 0.335 |
| 3012 | 0.335 |
| 3013 | 0.335 |
| 3014 | 0.335 |
| 3015 | 0.335 |
| 3016 | 0.335 |
| 3017 | 0.335 |
| 3018 | 0.335 |
| 3019 | 0.335 |
| 3020 | 0.335 |
| 3021 | 0.335 |
| 3022 | 0.334 |
| 3023 | 0.334 |
| 3024 | 0.334 |
| 3025 | 0.334 |
| 3026 | 0.334 |
| 3027 | 0.334 |
| 3028 | 0.334 |
| 3029 | 0.335 |
| 3030 | 0.335 |
| 3031 | 0.335 |
| 3032 | 0.334 |
| 3033 | 0.334 |
| 3034 | 0.334 |
| 3035 | 0.334 |
| 3036 | 0.334 |
| 3037 | 0.334 |
| 3038 | 0.334 |
| 3039 | 0.334 |
| 3040 | 0.334 |
| 3041 | 0.334 |
| 3042 | 0.334 |
| 3043 | 0.334 |
| 3044 | 0.334 |
| 3045 | 0.334 |
| 3046 | 0.334 |
| 3047 | 0.334 |
| 3048 | 0.334 |
| 3049 | 0.334 |
| 3050 | 0.334 |
| 3051 | 0.334 |
| 3052 | 0.334 |
| 3053 | 0.334 |
| 3054 | 0.334 |
| 3055 | 0.334 |
| 3056 | 0.334 |
| 3057 | 0.334 |
| 3058 | 0.334 |
| 3059 | 0.335 |
| 3060 | 0.335 |
| 3061 | 0.335 |
| 3062 | 0.335 |
| 3063 | 0.335 |
| 3064 | 0.335 |
| 3065 | 0.335 |
| 3066 | 0.334 |
| 3067 | 0.335 |
| 3068 | 0.335 |
| 3069 | 0.335 |
| 3070 | 0.335 |
| 3071 | 0.335 |
| 3072 | 0.335 |
| 3073 | 0.335 |
| 3074 | 0.335 |
| 3075 | 0.334 |
| 3076 | 0.334 |
| 3077 | 0.334 |
| 3078 | 0.334 |
| 3079 | 0.334 |
| 3080 | 0.334 |
| 3081 | 0.334 |
| 3082 | 0.334 |
| 3083 | 0.334 |
| 3084 | 0.334 |
| 3085 | 0.334 |
| 3086 | 0.334 |
| 3087 | 0.334 |
| 3088 | 0.335 |
| 3089 | 0.335 |
| 3090 | 0.335 |
| 3091 | 0.335 |
| 3092 | 0.335 |
| 3093 | 0.335 |
| 3094 | 0.335 |
| 3095 | 0.335 |
| 3096 | 0.335 |
| 3097 | 0.335 |
| 3098 | 0.335 |
| 3099 | 0.335 |
| 3100 | 0.335 |
| 3101 | 0.334 |
| 3102 | 0.334 |
| 3103 | 0.334 |
| 3104 | 0.334 |
| 3105 | 0.334 |
| 3106 | 0.334 |
| 3107 | 0.334 |
| 3108 | 0.334 |
| 3109 | 0.334 |
| 3110 | 0.334 |
| 3111 | 0.334 |
| 3112 | 0.334 |
| 3113 | 0.334 |
| 3114 | 0.334 |
| 3115 | 0.334 |
| 3116 | 0.334 |
| 3117 | 0.334 |
| 3118 | 0.334 |
| 3119 | 0.334 |
| 3120 | 0.334 |
| 3121 | 0.334 |
| 3122 | 0.334 |
| 3123 | 0.334 |
| 3124 | 0.334 |
| 3125 | 0.334 |
| 3126 | 0.334 |
| 3127 | 0.334 |
| 3128 | 0.334 |
| 3129 | 0.334 |
| 3130 | 0.334 |
| 3131 | 0.334 |
| 3132 | 0.334 |
| 3133 | 0.334 |
| 3134 | 0.334 |
| 3135 | 0.334 |
| 3136 | 0.334 |
| 3137 | 0.334 |
| 3138 | 0.334 |
| 3139 | 0.334 |
| 3140 | 0.334 |
| 3141 | 0.334 |
| 3142 | 0.334 |
| 3143 | 0.334 |
| 3144 | 0.334 |
| 3145 | 0.334 |
| 3146 | 0.334 |
| 3147 | 0.334 |
| 3148 | 0.334 |
| 3149 | 0.334 |
| 3150 | 0.334 |
| 3151 | 0.334 |
| 3152 | 0.334 |
| 3153 | 0.334 |
| 3154 | 0.334 |
| 3155 | 0.334 |
| 3156 | 0.334 |
| 3157 | 0.335 |
| 3158 | 0.334 |
| 3159 | 0.334 |
| 3160 | 0.334 |
| 3161 | 0.334 |
| 3162 | 0.335 |
| 3163 | 0.335 |
| 3164 | 0.335 |
| 3165 | 0.335 |
| 3166 | 0.335 |
| 3167 | 0.335 |
| 3168 | 0.334 |
| 3169 | 0.335 |
| 3170 | 0.334 |
| 3171 | 0.335 |
| 3172 | 0.334 |
| 3173 | 0.334 |
| 3174 | 0.334 |
| 3175 | 0.334 |
| 3176 | 0.334 |
| 3177 | 0.334 |
| 3178 | 0.334 |
| 3179 | 0.334 |
| 3180 | 0.334 |
| 3181 | 0.334 |
| 3182 | 0.334 |
| 3183 | 0.334 |
| 3184 | 0.334 |
| 3185 | 0.334 |
| 3186 | 0.334 |
| 3187 | 0.334 |
| 3188 | 0.334 |
| 3189 | 0.334 |
| 3190 | 0.334 |
| 3191 | 0.334 |
| 3192 | 0.334 |
| 3193 | 0.334 |
| 3194 | 0.334 |
| 3195 | 0.334 |
| 3196 | 0.334 |
| 3197 | 0.334 |
| 3198 | 0.334 |
| 3199 | 0.334 |
| 3200 | 0.334 |
| 3201 | 0.334 |
| 3202 | 0.334 |
| 3203 | 0.334 |
| 3204 | 0.334 |
| 3205 | 0.334 |
| 3206 | 0.334 |
| 3207 | 0.334 |
| 3208 | 0.334 |
| 3209 | 0.334 |
| 3210 | 0.334 |
| 3211 | 0.334 |
| 3212 | 0.334 |
| 3213 | 0.334 |
| 3214 | 0.334 |
| 3215 | 0.334 |
| 3216 | 0.334 |
| 3217 | 0.334 |
| 3218 | 0.334 |
| 3219 | 0.334 |
| 3220 | 0.334 |
| 3221 | 0.334 |
| 3222 | 0.334 |
| 3223 | 0.334 |
| 3224 | 0.334 |
| 3225 | 0.334 |
| 3226 | 0.334 |
| 3227 | 0.334 |
| 3228 | 0.334 |
| 3229 | 0.334 |
| 3230 | 0.334 |
| 3231 | 0.334 |
| 3232 | 0.334 |
| 3233 | 0.334 |
| 3234 | 0.334 |
| 3235 | 0.334 |
| 3236 | 0.334 |
| 3237 | 0.334 |
| 3238 | 0.334 |
| 3239 | 0.334 |
| 3240 | 0.334 |
| 3241 | 0.334 |
| 3242 | 0.334 |
| 3243 | 0.334 |
| 3244 | 0.334 |
| 3245 | 0.334 |
| 3246 | 0.334 |
| 3247 | 0.334 |
| 3248 | 0.334 |
| 3249 | 0.334 |
| 3250 | 0.334 |
| 3251 | 0.334 |
| 3252 | 0.334 |
| 3253 | 0.334 |
| 3254 | 0.334 |
| 3255 | 0.333 |
| 3256 | 0.333 |
| 3257 | 0.333 |
| 3258 | 0.333 |
| 3259 | 0.333 |
| 3260 | 0.333 |
| 3261 | 0.333 |
| 3262 | 0.333 |
| 3263 | 0.333 |
| 3264 | 0.333 |
| 3265 | 0.333 |
| 3266 | 0.333 |
| 3267 | 0.333 |
| 3268 | 0.333 |
| 3269 | 0.333 |
| 3270 | 0.333 |
| 3271 | 0.333 |
| 3272 | 0.333 |
| 3273 | 0.333 |
| 3274 | 0.333 |
| 3275 | 0.333 |
| 3276 | 0.333 |
| 3277 | 0.333 |
| 3278 | 0.333 |
| 3279 | 0.333 |
| 3280 | 0.333 |
| 3281 | 0.333 |
| 3282 | 0.333 |
| 3283 | 0.333 |
| 3284 | 0.333 |
| 3285 | 0.333 |
| 3286 | 0.333 |
| 3287 | 0.333 |
| 3288 | 0.333 |
| 3289 | 0.333 |
| 3290 | 0.333 |
| 3291 | 0.333 |
| 3292 | 0.333 |
| 3293 | 0.333 |
| 3294 | 0.333 |
| 3295 | 0.333 |
| 3296 | 0.333 |
| 3297 | 0.333 |
| 3298 | 0.333 |
| 3299 | 0.333 |
| 3300 | 0.333 |
| 3301 | 0.333 |
| 3302 | 0.333 |
| 3303 | 0.333 |
| 3304 | 0.333 |
| 3305 | 0.333 |
| 3306 | 0.333 |
| 3307 | 0.333 |
| 3308 | 0.333 |
| 3309 | 0.333 |
| 3310 | 0.333 |
| 3311 | 0.333 |
| 3312 | 0.333 |
| 3313 | 0.333 |
| 3314 | 0.333 |
| 3315 | 0.333 |
| 3316 | 0.333 |
| 3317 | 0.333 |
| 3318 | 0.333 |
| 3319 | 0.333 |
| 3320 | 0.333 |
| 3321 | 0.333 |
| 3322 | 0.333 |
| 3323 | 0.333 |
| 3324 | 0.332 |
| 3325 | 0.332 |
| 3326 | 0.332 |